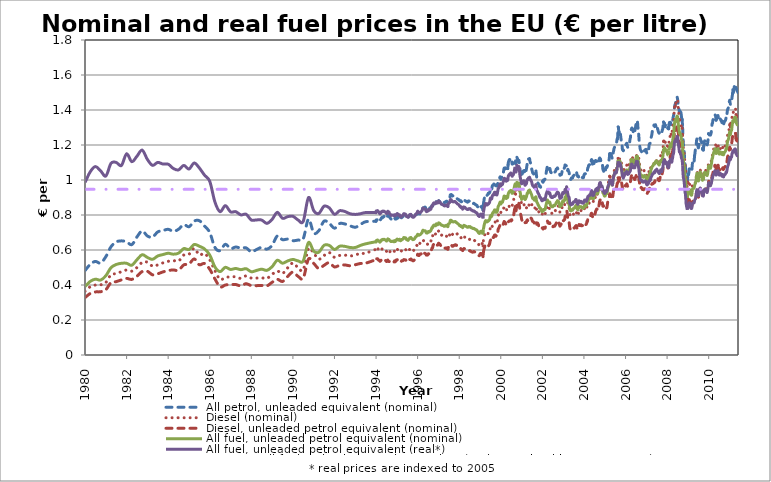
| Category | All petrol, unleaded equivalent (nominal) | Diesel (nominal) | Diesel, unleaded petrol equivalent (nominal) | All fuel, unleaded petrol equivalent (nominal) | All fuel, unleaded petrol equivalent (real*) | Average, all fuel, unleaded petrol equivalent (real*, weighted by consumption) |
|---|---|---|---|---|---|---|
| 1980-01-15 | 0.482 | 0.364 | 0.328 | 0.392 | 0.986 | 0.947 |
| 1980-04-15 | 0.518 | 0.39 | 0.351 | 0.42 | 1.047 | 0.947 |
| 1980-07-15 | 0.535 | 0.4 | 0.36 | 0.433 | 1.077 | 0.947 |
| 1980-10-15 | 0.525 | 0.401 | 0.362 | 0.428 | 1.052 | 0.947 |
| 1981-01-15 | 0.562 | 0.414 | 0.374 | 0.453 | 1.023 | 0.947 |
| 1981-04-15 | 0.618 | 0.459 | 0.413 | 0.499 | 1.095 | 0.947 |
| 1981-07-15 | 0.646 | 0.465 | 0.419 | 0.517 | 1.101 | 0.947 |
| 1981-10-15 | 0.652 | 0.476 | 0.429 | 0.524 | 1.083 | 0.947 |
| 1982-01-15 | 0.647 | 0.486 | 0.438 | 0.524 | 1.15 | 0.947 |
| 1982-04-15 | 0.631 | 0.479 | 0.432 | 0.513 | 1.105 | 0.947 |
| 1982-07-15 | 0.674 | 0.5 | 0.45 | 0.544 | 1.136 | 0.947 |
| 1982-10-15 | 0.709 | 0.529 | 0.477 | 0.573 | 1.171 | 0.947 |
| 1983-01-15 | 0.68 | 0.53 | 0.478 | 0.557 | 1.117 | 0.947 |
| 1983-04-15 | 0.674 | 0.508 | 0.458 | 0.547 | 1.084 | 0.947 |
| 1983-07-15 | 0.703 | 0.515 | 0.464 | 0.566 | 1.101 | 0.947 |
| 1983-10-15 | 0.711 | 0.527 | 0.475 | 0.574 | 1.091 | 0.947 |
| 1984-01-15 | 0.718 | 0.535 | 0.482 | 0.581 | 1.09 | 0.947 |
| 1984-04-15 | 0.707 | 0.539 | 0.486 | 0.576 | 1.066 | 0.947 |
| 1984-07-15 | 0.719 | 0.537 | 0.484 | 0.582 | 1.058 | 0.947 |
| 1984-10-15 | 0.745 | 0.571 | 0.515 | 0.608 | 1.083 | 0.947 |
| 1985-01-15 | 0.733 | 0.576 | 0.519 | 0.603 | 1.063 | 0.947 |
| 1985-04-15 | 0.765 | 0.609 | 0.549 | 0.631 | 1.097 | 0.947 |
| 1985-07-15 | 0.767 | 0.572 | 0.516 | 0.622 | 1.069 | 0.947 |
| 1985-10-15 | 0.737 | 0.58 | 0.523 | 0.606 | 1.028 | 0.947 |
| 1986-01-15 | 0.7 | 0.543 | 0.49 | 0.571 | 0.992 | 0.947 |
| 1986-04-15 | 0.615 | 0.482 | 0.435 | 0.503 | 0.874 | 0.947 |
| 1986-07-15 | 0.596 | 0.432 | 0.389 | 0.476 | 0.819 | 0.947 |
| 1986-10-15 | 0.633 | 0.444 | 0.4 | 0.501 | 0.853 | 0.947 |
| 1987-01-15 | 0.608 | 0.446 | 0.402 | 0.489 | 0.818 | 0.947 |
| 1987-04-15 | 0.617 | 0.447 | 0.403 | 0.494 | 0.819 | 0.947 |
| 1987-07-15 | 0.611 | 0.438 | 0.395 | 0.488 | 0.801 | 0.947 |
| 1987-10-15 | 0.612 | 0.452 | 0.407 | 0.493 | 0.804 | 0.947 |
| 1988-01-15 | 0.589 | 0.44 | 0.396 | 0.476 | 0.771 | 0.947 |
| 1988-04-15 | 0.603 | 0.44 | 0.396 | 0.483 | 0.772 | 0.947 |
| 1988-07-15 | 0.615 | 0.441 | 0.397 | 0.49 | 0.771 | 0.947 |
| 1988-10-15 | 0.605 | 0.438 | 0.395 | 0.484 | 0.752 | 0.947 |
| 1989-01-15 | 0.627 | 0.461 | 0.416 | 0.505 | 0.775 | 0.947 |
| 1989-04-15 | 0.68 | 0.48 | 0.432 | 0.542 | 0.815 | 0.947 |
| 1989-07-15 | 0.659 | 0.466 | 0.42 | 0.525 | 0.781 | 0.947 |
| 1989-10-15 | 0.662 | 0.498 | 0.449 | 0.538 | 0.79 | 0.947 |
| 1990-01-15 | 0.653 | 0.526 | 0.474 | 0.546 | 0.793 | 0.947 |
| 1990-04-15 | 0.657 | 0.499 | 0.45 | 0.538 | 0.772 | 0.947 |
| 1990-07-15 | 0.664 | 0.487 | 0.439 | 0.538 | 0.764 | 0.947 |
| 1990-10-15 | 0.776 | 0.608 | 0.548 | 0.643 | 0.9 | 0.947 |
| 1991-01-15 | 0.697 | 0.581 | 0.524 | 0.593 | 0.825 | 0.947 |
| 1991-04-15 | 0.711 | 0.548 | 0.494 | 0.588 | 0.809 | 0.947 |
| 1991-07-15 | 0.765 | 0.568 | 0.512 | 0.627 | 0.85 | 0.947 |
| 1991-10-15 | 0.753 | 0.585 | 0.528 | 0.626 | 0.841 | 0.947 |
| 1992-01-15 | 0.724 | 0.558 | 0.503 | 0.603 | 0.804 | 0.947 |
| 1992-04-15 | 0.751 | 0.569 | 0.513 | 0.622 | 0.825 | 0.947 |
| 1992-07-15 | 0.749 | 0.571 | 0.515 | 0.621 | 0.82 | 0.947 |
| 1992-10-15 | 0.738 | 0.566 | 0.51 | 0.614 | 0.807 | 0.947 |
| 1993-01-15 | 0.73 | 0.572 | 0.516 | 0.614 | 0.803 | 0.947 |
| 1993-04-15 | 0.745 | 0.58 | 0.523 | 0.626 | 0.807 | 0.947 |
| 1993-07-15 | 0.761 | 0.582 | 0.525 | 0.635 | 0.814 | 0.947 |
| 1994-01-03 | 0.764 | 0.603 | 0.543 | 0.647 | 0.814 | 0.947 |
| 1994-01-10 | 0.763 | 0.601 | 0.542 | 0.645 | 0.813 | 0.947 |
| 1994-01-17 | 0.772 | 0.61 | 0.55 | 0.653 | 0.823 | 0.947 |
| 1994-01-24 | 0.77 | 0.61 | 0.55 | 0.652 | 0.822 | 0.947 |
| 1994-01-31 | 0.771 | 0.61 | 0.55 | 0.653 | 0.822 | 0.947 |
| 1994-02-07 | 0.779 | 0.611 | 0.551 | 0.657 | 0.825 | 0.947 |
| 1994-02-14 | 0.778 | 0.609 | 0.549 | 0.656 | 0.824 | 0.947 |
| 1994-02-21 | 0.775 | 0.605 | 0.545 | 0.653 | 0.82 | 0.947 |
| 1994-02-28 | 0.774 | 0.601 | 0.542 | 0.651 | 0.817 | 0.947 |
| 1994-03-07 | 0.776 | 0.602 | 0.542 | 0.652 | 0.816 | 0.947 |
| 1994-03-14 | 0.771 | 0.598 | 0.54 | 0.649 | 0.811 | 0.947 |
| 1994-03-21 | 0.767 | 0.595 | 0.536 | 0.645 | 0.807 | 0.947 |
| 1994-03-28 | 0.77 | 0.595 | 0.536 | 0.647 | 0.809 | 0.947 |
| 1994-04-11 | 0.778 | 0.6 | 0.541 | 0.652 | 0.813 | 0.947 |
| 1994-04-18 | 0.783 | 0.604 | 0.545 | 0.657 | 0.819 | 0.947 |
| 1994-04-25 | 0.783 | 0.604 | 0.544 | 0.657 | 0.819 | 0.947 |
| 1994-05-02 | 0.787 | 0.607 | 0.547 | 0.66 | 0.822 | 0.947 |
| 1994-05-09 | 0.784 | 0.604 | 0.544 | 0.657 | 0.818 | 0.947 |
| 1994-05-16 | 0.788 | 0.607 | 0.547 | 0.661 | 0.822 | 0.947 |
| 1994-05-23 | 0.79 | 0.603 | 0.544 | 0.66 | 0.822 | 0.947 |
| 1994-05-30 | 0.789 | 0.602 | 0.542 | 0.66 | 0.821 | 0.947 |
| 1994-06-06 | 0.792 | 0.601 | 0.542 | 0.661 | 0.821 | 0.947 |
| 1994-06-13 | 0.791 | 0.6 | 0.541 | 0.66 | 0.82 | 0.947 |
| 1994-06-20 | 0.788 | 0.599 | 0.54 | 0.658 | 0.817 | 0.947 |
| 1994-06-27 | 0.787 | 0.599 | 0.54 | 0.657 | 0.816 | 0.947 |
| 1994-07-04 | 0.786 | 0.598 | 0.539 | 0.656 | 0.814 | 0.947 |
| 1994-07-11 | 0.784 | 0.595 | 0.537 | 0.654 | 0.812 | 0.947 |
| 1994-07-18 | 0.78 | 0.592 | 0.534 | 0.651 | 0.808 | 0.947 |
| 1994-07-25 | 0.785 | 0.595 | 0.537 | 0.655 | 0.813 | 0.947 |
| 1994-08-01 | 0.788 | 0.595 | 0.536 | 0.656 | 0.812 | 0.947 |
| 1994-08-08 | 0.797 | 0.602 | 0.543 | 0.664 | 0.821 | 0.947 |
| 1994-08-22 | 0.797 | 0.594 | 0.535 | 0.661 | 0.817 | 0.947 |
| 1994-08-29 | 0.796 | 0.593 | 0.535 | 0.66 | 0.817 | 0.947 |
| 1994-09-05 | 0.792 | 0.592 | 0.534 | 0.657 | 0.811 | 0.947 |
| 1994-09-12 | 0.786 | 0.59 | 0.532 | 0.654 | 0.807 | 0.947 |
| 1994-09-19 | 0.783 | 0.591 | 0.533 | 0.652 | 0.805 | 0.947 |
| 1994-09-26 | 0.78 | 0.591 | 0.533 | 0.651 | 0.803 | 0.947 |
| 1994-10-03 | 0.777 | 0.589 | 0.531 | 0.648 | 0.798 | 0.947 |
| 1994-10-10 | 0.777 | 0.59 | 0.532 | 0.649 | 0.798 | 0.947 |
| 1994-10-17 | 0.777 | 0.593 | 0.535 | 0.65 | 0.8 | 0.947 |
| 1994-10-24 | 0.775 | 0.593 | 0.535 | 0.648 | 0.798 | 0.947 |
| 1994-11-07 | 0.779 | 0.592 | 0.534 | 0.65 | 0.799 | 0.947 |
| 1994-11-14 | 0.778 | 0.592 | 0.533 | 0.65 | 0.798 | 0.947 |
| 1994-11-21 | 0.779 | 0.594 | 0.536 | 0.651 | 0.8 | 0.947 |
| 1994-11-28 | 0.773 | 0.59 | 0.532 | 0.647 | 0.795 | 0.947 |
| 1994-12-05 | 0.781 | 0.596 | 0.538 | 0.653 | 0.801 | 0.947 |
| 1994-12-12 | 0.78 | 0.595 | 0.536 | 0.652 | 0.8 | 0.947 |
| 1994-12-19 | 0.776 | 0.591 | 0.533 | 0.649 | 0.795 | 0.947 |
| 1995-01-02 | 0.78 | 0.602 | 0.542 | 0.658 | 0.803 | 0.947 |
| 1995-01-09 | 0.778 | 0.599 | 0.54 | 0.655 | 0.8 | 0.947 |
| 1995-01-16 | 0.786 | 0.603 | 0.544 | 0.661 | 0.807 | 0.947 |
| 1995-01-23 | 0.786 | 0.604 | 0.544 | 0.662 | 0.808 | 0.947 |
| 1995-01-30 | 0.783 | 0.6 | 0.541 | 0.658 | 0.804 | 0.947 |
| 1995-02-06 | 0.784 | 0.599 | 0.54 | 0.659 | 0.801 | 0.947 |
| 1995-02-13 | 0.785 | 0.601 | 0.542 | 0.66 | 0.802 | 0.947 |
| 1995-02-20 | 0.78 | 0.597 | 0.538 | 0.656 | 0.797 | 0.947 |
| 1995-02-27 | 0.786 | 0.598 | 0.539 | 0.659 | 0.801 | 0.947 |
| 1995-03-06 | 0.787 | 0.599 | 0.54 | 0.661 | 0.799 | 0.947 |
| 1995-03-13 | 0.78 | 0.594 | 0.536 | 0.655 | 0.792 | 0.947 |
| 1995-03-20 | 0.778 | 0.591 | 0.533 | 0.653 | 0.789 | 0.947 |
| 1995-03-27 | 0.78 | 0.593 | 0.535 | 0.655 | 0.792 | 0.947 |
| 1995-04-03 | 0.781 | 0.594 | 0.535 | 0.656 | 0.789 | 0.947 |
| 1995-04-10 | 0.787 | 0.598 | 0.539 | 0.66 | 0.795 | 0.947 |
| 1995-04-24 | 0.789 | 0.597 | 0.538 | 0.661 | 0.796 | 0.947 |
| 1995-05-02 | 0.792 | 0.599 | 0.54 | 0.663 | 0.798 | 0.947 |
| 1995-05-08 | 0.793 | 0.6 | 0.541 | 0.664 | 0.8 | 0.947 |
| 1995-05-15 | 0.802 | 0.605 | 0.545 | 0.671 | 0.808 | 0.947 |
| 1995-05-22 | 0.801 | 0.602 | 0.542 | 0.669 | 0.805 | 0.947 |
| 1995-05-29 | 0.802 | 0.604 | 0.545 | 0.671 | 0.807 | 0.947 |
| 1995-06-06 | 0.802 | 0.604 | 0.544 | 0.67 | 0.806 | 0.947 |
| 1995-06-12 | 0.801 | 0.603 | 0.543 | 0.669 | 0.804 | 0.947 |
| 1995-06-19 | 0.8 | 0.603 | 0.543 | 0.669 | 0.804 | 0.947 |
| 1995-06-26 | 0.797 | 0.598 | 0.539 | 0.665 | 0.799 | 0.947 |
| 1995-07-03 | 0.789 | 0.593 | 0.534 | 0.659 | 0.791 | 0.947 |
| 1995-07-10 | 0.788 | 0.593 | 0.534 | 0.658 | 0.79 | 0.947 |
| 1995-07-17 | 0.788 | 0.595 | 0.536 | 0.659 | 0.791 | 0.947 |
| 1995-07-24 | 0.786 | 0.594 | 0.536 | 0.658 | 0.79 | 0.947 |
| 1995-07-31 | 0.782 | 0.592 | 0.533 | 0.655 | 0.786 | 0.947 |
| 1995-08-07 | 0.788 | 0.595 | 0.537 | 0.659 | 0.79 | 0.947 |
| 1995-08-21 | 0.795 | 0.599 | 0.54 | 0.664 | 0.796 | 0.947 |
| 1995-08-28 | 0.799 | 0.605 | 0.545 | 0.669 | 0.802 | 0.947 |
| 1995-09-04 | 0.799 | 0.605 | 0.546 | 0.669 | 0.801 | 0.947 |
| 1995-09-11 | 0.796 | 0.604 | 0.545 | 0.667 | 0.799 | 0.947 |
| 1995-09-18 | 0.802 | 0.609 | 0.549 | 0.672 | 0.804 | 0.947 |
| 1995-09-25 | 0.795 | 0.606 | 0.546 | 0.667 | 0.798 | 0.947 |
| 1995-10-02 | 0.794 | 0.605 | 0.545 | 0.666 | 0.796 | 0.947 |
| 1995-10-09 | 0.789 | 0.601 | 0.542 | 0.662 | 0.791 | 0.947 |
| 1995-10-16 | 0.787 | 0.6 | 0.541 | 0.661 | 0.79 | 0.947 |
| 1995-10-23 | 0.785 | 0.598 | 0.539 | 0.659 | 0.787 | 0.947 |
| 1995-10-30 | 0.788 | 0.599 | 0.54 | 0.661 | 0.789 | 0.947 |
| 1995-11-06 | 0.787 | 0.598 | 0.539 | 0.66 | 0.787 | 0.947 |
| 1995-11-13 | 0.79 | 0.602 | 0.542 | 0.663 | 0.791 | 0.947 |
| 1995-11-20 | 0.791 | 0.601 | 0.542 | 0.663 | 0.792 | 0.947 |
| 1995-11-27 | 0.796 | 0.606 | 0.546 | 0.668 | 0.797 | 0.947 |
| 1995-12-04 | 0.801 | 0.61 | 0.55 | 0.672 | 0.801 | 0.947 |
| 1995-12-11 | 0.802 | 0.615 | 0.555 | 0.675 | 0.804 | 0.947 |
| 1995-12-18 | 0.801 | 0.618 | 0.557 | 0.675 | 0.805 | 0.947 |
| 1996-01-08 | 0.807 | 0.63 | 0.568 | 0.684 | 0.816 | 0.947 |
| 1996-01-15 | 0.811 | 0.639 | 0.576 | 0.69 | 0.822 | 0.947 |
| 1996-01-22 | 0.809 | 0.636 | 0.573 | 0.688 | 0.819 | 0.947 |
| 1996-01-29 | 0.807 | 0.632 | 0.57 | 0.685 | 0.816 | 0.947 |
| 1996-02-05 | 0.808 | 0.63 | 0.568 | 0.685 | 0.812 | 0.947 |
| 1996-02-12 | 0.807 | 0.632 | 0.57 | 0.685 | 0.813 | 0.947 |
| 1996-02-19 | 0.807 | 0.636 | 0.574 | 0.687 | 0.815 | 0.947 |
| 1996-02-26 | 0.806 | 0.639 | 0.576 | 0.687 | 0.816 | 0.947 |
| 1996-03-04 | 0.809 | 0.64 | 0.577 | 0.689 | 0.815 | 0.947 |
| 1996-03-11 | 0.813 | 0.64 | 0.577 | 0.691 | 0.816 | 0.947 |
| 1996-03-18 | 0.816 | 0.641 | 0.578 | 0.694 | 0.82 | 0.947 |
| 1996-03-25 | 0.819 | 0.644 | 0.581 | 0.696 | 0.822 | 0.947 |
| 1996-04-01 | 0.822 | 0.65 | 0.586 | 0.7 | 0.825 | 0.947 |
| 1996-04-15 | 0.839 | 0.658 | 0.593 | 0.712 | 0.84 | 0.947 |
| 1996-04-22 | 0.839 | 0.656 | 0.592 | 0.712 | 0.839 | 0.947 |
| 1996-04-29 | 0.839 | 0.652 | 0.588 | 0.71 | 0.837 | 0.947 |
| 1996-05-06 | 0.842 | 0.647 | 0.583 | 0.71 | 0.834 | 0.947 |
| 1996-05-13 | 0.844 | 0.645 | 0.581 | 0.709 | 0.834 | 0.947 |
| 1996-05-20 | 0.845 | 0.645 | 0.581 | 0.71 | 0.835 | 0.947 |
| 1996-05-28 | 0.845 | 0.643 | 0.58 | 0.709 | 0.834 | 0.947 |
| 1996-06-03 | 0.84 | 0.641 | 0.578 | 0.706 | 0.83 | 0.947 |
| 1996-06-10 | 0.833 | 0.637 | 0.575 | 0.701 | 0.824 | 0.947 |
| 1996-06-17 | 0.829 | 0.633 | 0.571 | 0.697 | 0.819 | 0.947 |
| 1996-06-24 | 0.833 | 0.634 | 0.572 | 0.699 | 0.822 | 0.947 |
| 1996-07-01 | 0.829 | 0.633 | 0.571 | 0.697 | 0.82 | 0.947 |
| 1996-07-08 | 0.831 | 0.634 | 0.571 | 0.698 | 0.822 | 0.947 |
| 1996-07-15 | 0.834 | 0.638 | 0.575 | 0.702 | 0.826 | 0.947 |
| 1996-07-22 | 0.839 | 0.642 | 0.579 | 0.706 | 0.831 | 0.947 |
| 1996-07-29 | 0.834 | 0.64 | 0.577 | 0.702 | 0.827 | 0.947 |
| 1996-08-05 | 0.835 | 0.64 | 0.577 | 0.703 | 0.827 | 0.947 |
| 1996-08-19 | 0.841 | 0.644 | 0.581 | 0.708 | 0.833 | 0.947 |
| 1996-08-26 | 0.84 | 0.643 | 0.58 | 0.707 | 0.832 | 0.947 |
| 1996-09-02 | 0.843 | 0.647 | 0.584 | 0.71 | 0.833 | 0.947 |
| 1996-09-09 | 0.846 | 0.658 | 0.593 | 0.716 | 0.839 | 0.947 |
| 1996-09-16 | 0.849 | 0.67 | 0.604 | 0.722 | 0.847 | 0.947 |
| 1996-09-23 | 0.854 | 0.678 | 0.611 | 0.728 | 0.854 | 0.947 |
| 1996-09-30 | 0.85 | 0.677 | 0.61 | 0.725 | 0.851 | 0.947 |
| 1996-10-07 | 0.854 | 0.685 | 0.618 | 0.731 | 0.856 | 0.947 |
| 1996-10-14 | 0.858 | 0.697 | 0.628 | 0.738 | 0.865 | 0.947 |
| 1996-10-21 | 0.86 | 0.7 | 0.631 | 0.741 | 0.868 | 0.947 |
| 1996-10-28 | 0.863 | 0.7 | 0.631 | 0.742 | 0.869 | 0.947 |
| 1996-11-04 | 0.864 | 0.697 | 0.628 | 0.741 | 0.868 | 0.947 |
| 1996-11-11 | 0.863 | 0.692 | 0.624 | 0.739 | 0.865 | 0.947 |
| 1996-11-18 | 0.865 | 0.692 | 0.624 | 0.74 | 0.866 | 0.947 |
| 1996-11-25 | 0.864 | 0.691 | 0.623 | 0.739 | 0.865 | 0.947 |
| 1996-12-02 | 0.875 | 0.698 | 0.63 | 0.747 | 0.872 | 0.947 |
| 1996-12-09 | 0.876 | 0.702 | 0.633 | 0.749 | 0.875 | 0.947 |
| 1996-12-16 | 0.871 | 0.697 | 0.628 | 0.745 | 0.87 | 0.947 |
| 1997-01-06 | 0.872 | 0.698 | 0.629 | 0.746 | 0.869 | 0.947 |
| 1997-01-13 | 0.878 | 0.706 | 0.637 | 0.752 | 0.877 | 0.947 |
| 1997-01-20 | 0.883 | 0.708 | 0.639 | 0.755 | 0.881 | 0.947 |
| 1997-01-27 | 0.878 | 0.703 | 0.633 | 0.75 | 0.875 | 0.947 |
| 1997-02-03 | 0.876 | 0.7 | 0.631 | 0.749 | 0.871 | 0.947 |
| 1997-02-10 | 0.88 | 0.702 | 0.633 | 0.751 | 0.874 | 0.947 |
| 1997-02-17 | 0.879 | 0.697 | 0.628 | 0.748 | 0.871 | 0.947 |
| 1997-02-24 | 0.875 | 0.693 | 0.625 | 0.745 | 0.867 | 0.947 |
| 1997-03-03 | 0.874 | 0.691 | 0.623 | 0.744 | 0.864 | 0.947 |
| 1997-03-10 | 0.874 | 0.685 | 0.618 | 0.741 | 0.861 | 0.947 |
| 1997-03-17 | 0.876 | 0.684 | 0.617 | 0.742 | 0.862 | 0.947 |
| 1997-03-24 | 0.875 | 0.683 | 0.616 | 0.741 | 0.86 | 0.947 |
| 1997-04-07 | 0.874 | 0.68 | 0.613 | 0.739 | 0.858 | 0.947 |
| 1997-04-14 | 0.874 | 0.679 | 0.612 | 0.739 | 0.857 | 0.947 |
| 1997-04-21 | 0.87 | 0.676 | 0.609 | 0.735 | 0.853 | 0.947 |
| 1997-04-28 | 0.872 | 0.676 | 0.61 | 0.737 | 0.855 | 0.947 |
| 1997-05-05 | 0.871 | 0.676 | 0.609 | 0.736 | 0.851 | 0.947 |
| 1997-05-12 | 0.875 | 0.678 | 0.611 | 0.739 | 0.855 | 0.947 |
| 1997-05-19 | 0.873 | 0.676 | 0.609 | 0.737 | 0.853 | 0.947 |
| 1997-05-26 | 0.876 | 0.678 | 0.612 | 0.74 | 0.856 | 0.947 |
| 1997-06-02 | 0.879 | 0.679 | 0.612 | 0.741 | 0.857 | 0.947 |
| 1997-06-09 | 0.879 | 0.678 | 0.611 | 0.741 | 0.857 | 0.947 |
| 1997-06-16 | 0.874 | 0.672 | 0.606 | 0.736 | 0.851 | 0.947 |
| 1997-06-23 | 0.875 | 0.673 | 0.607 | 0.737 | 0.852 | 0.947 |
| 1997-06-30 | 0.872 | 0.669 | 0.604 | 0.733 | 0.848 | 0.947 |
| 1997-07-07 | 0.889 | 0.681 | 0.614 | 0.747 | 0.864 | 0.947 |
| 1997-07-14 | 0.892 | 0.683 | 0.616 | 0.75 | 0.867 | 0.947 |
| 1997-07-28 | 0.896 | 0.685 | 0.618 | 0.753 | 0.871 | 0.947 |
| 1997-08-04 | 0.901 | 0.69 | 0.622 | 0.758 | 0.874 | 0.947 |
| 1997-08-11 | 0.915 | 0.701 | 0.632 | 0.769 | 0.887 | 0.947 |
| 1997-08-18 | 0.913 | 0.699 | 0.63 | 0.768 | 0.886 | 0.947 |
| 1997-08-25 | 0.917 | 0.699 | 0.631 | 0.77 | 0.888 | 0.947 |
| 1997-09-01 | 0.916 | 0.697 | 0.629 | 0.768 | 0.884 | 0.947 |
| 1997-09-08 | 0.911 | 0.693 | 0.625 | 0.764 | 0.879 | 0.947 |
| 1997-09-15 | 0.909 | 0.689 | 0.621 | 0.761 | 0.876 | 0.947 |
| 1997-09-22 | 0.911 | 0.69 | 0.622 | 0.763 | 0.878 | 0.947 |
| 1997-09-29 | 0.906 | 0.69 | 0.622 | 0.76 | 0.875 | 0.947 |
| 1997-10-06 | 0.905 | 0.692 | 0.624 | 0.761 | 0.875 | 0.947 |
| 1997-10-13 | 0.904 | 0.695 | 0.626 | 0.761 | 0.876 | 0.947 |
| 1997-10-20 | 0.905 | 0.695 | 0.627 | 0.762 | 0.877 | 0.947 |
| 1997-10-27 | 0.904 | 0.696 | 0.627 | 0.762 | 0.876 | 0.947 |
| 1997-11-03 | 0.905 | 0.698 | 0.629 | 0.763 | 0.877 | 0.947 |
| 1997-11-10 | 0.901 | 0.699 | 0.63 | 0.761 | 0.875 | 0.947 |
| 1997-11-17 | 0.899 | 0.696 | 0.627 | 0.758 | 0.871 | 0.947 |
| 1997-11-24 | 0.896 | 0.694 | 0.626 | 0.757 | 0.87 | 0.947 |
| 1997-12-01 | 0.895 | 0.695 | 0.627 | 0.757 | 0.868 | 0.947 |
| 1997-12-08 | 0.894 | 0.692 | 0.624 | 0.754 | 0.866 | 0.947 |
| 1997-12-15 | 0.891 | 0.69 | 0.622 | 0.752 | 0.863 | 0.947 |
| 1998-01-05 | 0.888 | 0.684 | 0.617 | 0.746 | 0.859 | 0.947 |
| 1998-01-12 | 0.886 | 0.682 | 0.615 | 0.745 | 0.857 | 0.947 |
| 1998-01-19 | 0.882 | 0.676 | 0.609 | 0.74 | 0.852 | 0.947 |
| 1998-01-26 | 0.881 | 0.674 | 0.608 | 0.738 | 0.85 | 0.947 |
| 1998-02-02 | 0.88 | 0.673 | 0.607 | 0.738 | 0.847 | 0.947 |
| 1998-02-09 | 0.882 | 0.675 | 0.609 | 0.739 | 0.849 | 0.947 |
| 1998-02-16 | 0.876 | 0.67 | 0.604 | 0.734 | 0.843 | 0.947 |
| 1998-02-23 | 0.876 | 0.669 | 0.603 | 0.734 | 0.842 | 0.947 |
| 1998-03-02 | 0.875 | 0.667 | 0.601 | 0.732 | 0.839 | 0.947 |
| 1998-03-09 | 0.876 | 0.666 | 0.6 | 0.732 | 0.839 | 0.947 |
| 1998-03-16 | 0.87 | 0.661 | 0.596 | 0.727 | 0.833 | 0.947 |
| 1998-03-23 | 0.876 | 0.666 | 0.6 | 0.732 | 0.838 | 0.947 |
| 1998-03-30 | 0.883 | 0.672 | 0.606 | 0.739 | 0.846 | 0.947 |
| 1998-04-06 | 0.885 | 0.675 | 0.608 | 0.741 | 0.846 | 0.947 |
| 1998-04-20 | 0.883 | 0.673 | 0.607 | 0.739 | 0.844 | 0.947 |
| 1998-04-27 | 0.882 | 0.672 | 0.606 | 0.738 | 0.843 | 0.947 |
| 1998-05-04 | 0.881 | 0.671 | 0.605 | 0.737 | 0.839 | 0.947 |
| 1998-05-11 | 0.878 | 0.67 | 0.604 | 0.735 | 0.837 | 0.947 |
| 1998-05-18 | 0.878 | 0.668 | 0.603 | 0.735 | 0.836 | 0.947 |
| 1998-05-25 | 0.877 | 0.665 | 0.599 | 0.732 | 0.834 | 0.947 |
| 1998-06-01 | 0.876 | 0.664 | 0.599 | 0.732 | 0.833 | 0.947 |
| 1998-06-08 | 0.873 | 0.662 | 0.597 | 0.729 | 0.831 | 0.947 |
| 1998-06-15 | 0.875 | 0.662 | 0.596 | 0.73 | 0.831 | 0.947 |
| 1998-06-22 | 0.878 | 0.661 | 0.596 | 0.731 | 0.833 | 0.947 |
| 1998-06-29 | 0.881 | 0.663 | 0.598 | 0.734 | 0.836 | 0.947 |
| 1998-07-06 | 0.878 | 0.662 | 0.597 | 0.732 | 0.834 | 0.947 |
| 1998-07-13 | 0.881 | 0.661 | 0.596 | 0.733 | 0.836 | 0.947 |
| 1998-07-20 | 0.882 | 0.662 | 0.596 | 0.734 | 0.837 | 0.947 |
| 1998-07-27 | 0.883 | 0.66 | 0.595 | 0.733 | 0.836 | 0.947 |
| 1998-08-03 | 0.878 | 0.657 | 0.592 | 0.73 | 0.831 | 0.947 |
| 1998-08-10 | 0.875 | 0.656 | 0.592 | 0.728 | 0.829 | 0.947 |
| 1998-08-17 | 0.874 | 0.654 | 0.59 | 0.727 | 0.828 | 0.947 |
| 1998-08-24 | 0.875 | 0.654 | 0.589 | 0.727 | 0.828 | 0.947 |
| 1998-08-31 | 0.875 | 0.653 | 0.589 | 0.726 | 0.827 | 0.947 |
| 1998-09-07 | 0.871 | 0.652 | 0.587 | 0.724 | 0.823 | 0.947 |
| 1998-09-14 | 0.868 | 0.652 | 0.588 | 0.723 | 0.822 | 0.947 |
| 1998-09-21 | 0.866 | 0.654 | 0.59 | 0.722 | 0.822 | 0.947 |
| 1998-09-28 | 0.867 | 0.656 | 0.591 | 0.724 | 0.824 | 0.947 |
| 1998-10-05 | 0.864 | 0.654 | 0.59 | 0.722 | 0.821 | 0.947 |
| 1998-10-12 | 0.864 | 0.654 | 0.589 | 0.721 | 0.821 | 0.947 |
| 1998-10-19 | 0.861 | 0.651 | 0.587 | 0.719 | 0.818 | 0.947 |
| 1998-10-26 | 0.86 | 0.65 | 0.586 | 0.718 | 0.817 | 0.947 |
| 1998-11-02 | 0.858 | 0.647 | 0.584 | 0.715 | 0.814 | 0.947 |
| 1998-11-09 | 0.858 | 0.648 | 0.584 | 0.715 | 0.814 | 0.947 |
| 1998-11-16 | 0.856 | 0.646 | 0.583 | 0.714 | 0.812 | 0.947 |
| 1998-11-23 | 0.854 | 0.646 | 0.582 | 0.713 | 0.811 | 0.947 |
| 1998-11-30 | 0.848 | 0.641 | 0.578 | 0.707 | 0.805 | 0.947 |
| 1998-12-07 | 0.846 | 0.638 | 0.575 | 0.705 | 0.802 | 0.947 |
| 1998-12-14 | 0.841 | 0.634 | 0.571 | 0.701 | 0.796 | 0.947 |
| 1999-01-04 | 0.833 | 0.629 | 0.567 | 0.694 | 0.791 | 0.947 |
| 1999-01-11 | 0.839 | 0.636 | 0.574 | 0.7 | 0.798 | 0.947 |
| 1999-01-18 | 0.843 | 0.642 | 0.579 | 0.705 | 0.803 | 0.947 |
| 1999-01-25 | 0.846 | 0.643 | 0.58 | 0.706 | 0.805 | 0.947 |
| 1999-02-01 | 0.847 | 0.644 | 0.58 | 0.707 | 0.804 | 0.947 |
| 1999-02-08 | 0.848 | 0.642 | 0.578 | 0.707 | 0.804 | 0.947 |
| 1999-02-15 | 0.842 | 0.636 | 0.573 | 0.701 | 0.797 | 0.947 |
| 1999-02-22 | 0.845 | 0.637 | 0.574 | 0.703 | 0.799 | 0.947 |
| 1999-03-01 | 0.844 | 0.636 | 0.574 | 0.702 | 0.795 | 0.947 |
| 1999-03-08 | 0.829 | 0.623 | 0.562 | 0.689 | 0.78 | 0.947 |
| 1999-03-15 | 0.863 | 0.653 | 0.589 | 0.719 | 0.814 | 0.947 |
| 1999-03-22 | 0.876 | 0.663 | 0.598 | 0.73 | 0.827 | 0.947 |
| 1999-03-29 | 0.891 | 0.675 | 0.609 | 0.743 | 0.841 | 0.947 |
| 1999-04-12 | 0.909 | 0.692 | 0.624 | 0.76 | 0.857 | 0.947 |
| 1999-04-19 | 0.916 | 0.698 | 0.629 | 0.766 | 0.863 | 0.947 |
| 1999-04-26 | 0.919 | 0.699 | 0.631 | 0.768 | 0.866 | 0.947 |
| 1999-05-03 | 0.918 | 0.698 | 0.63 | 0.767 | 0.864 | 0.947 |
| 1999-05-10 | 0.915 | 0.694 | 0.626 | 0.764 | 0.86 | 0.947 |
| 1999-05-17 | 0.912 | 0.69 | 0.622 | 0.76 | 0.857 | 0.947 |
| 1999-05-24 | 0.915 | 0.691 | 0.623 | 0.762 | 0.858 | 0.947 |
| 1999-05-31 | 0.917 | 0.691 | 0.623 | 0.763 | 0.859 | 0.947 |
| 1999-06-07 | 0.923 | 0.695 | 0.627 | 0.768 | 0.865 | 0.947 |
| 1999-06-14 | 0.922 | 0.693 | 0.625 | 0.767 | 0.863 | 0.947 |
| 1999-06-21 | 0.925 | 0.696 | 0.628 | 0.769 | 0.867 | 0.947 |
| 1999-06-28 | 0.926 | 0.7 | 0.631 | 0.772 | 0.869 | 0.947 |
| 1999-07-05 | 0.93 | 0.711 | 0.641 | 0.778 | 0.877 | 0.947 |
| 1999-07-12 | 0.943 | 0.722 | 0.651 | 0.79 | 0.891 | 0.947 |
| 1999-07-19 | 0.949 | 0.729 | 0.657 | 0.796 | 0.897 | 0.947 |
| 1999-07-26 | 0.941 | 0.722 | 0.651 | 0.789 | 0.889 | 0.947 |
| 1999-08-02 | 0.948 | 0.727 | 0.656 | 0.795 | 0.895 | 0.947 |
| 1999-08-09 | 0.947 | 0.725 | 0.654 | 0.793 | 0.893 | 0.947 |
| 1999-08-16 | 0.963 | 0.734 | 0.662 | 0.805 | 0.906 | 0.947 |
| 1999-08-23 | 0.968 | 0.738 | 0.665 | 0.81 | 0.911 | 0.947 |
| 1999-08-30 | 0.972 | 0.744 | 0.671 | 0.814 | 0.916 | 0.947 |
| 1999-09-06 | 0.97 | 0.744 | 0.671 | 0.813 | 0.913 | 0.947 |
| 1999-09-13 | 0.974 | 0.746 | 0.673 | 0.816 | 0.916 | 0.947 |
| 1999-09-20 | 0.983 | 0.754 | 0.68 | 0.825 | 0.925 | 0.947 |
| 1999-09-27 | 0.988 | 0.76 | 0.685 | 0.829 | 0.93 | 0.947 |
| 1999-10-04 | 0.983 | 0.758 | 0.683 | 0.826 | 0.927 | 0.947 |
| 1999-10-11 | 0.986 | 0.76 | 0.686 | 0.829 | 0.93 | 0.947 |
| 1999-10-18 | 0.967 | 0.753 | 0.679 | 0.816 | 0.916 | 0.947 |
| 1999-10-25 | 0.972 | 0.755 | 0.681 | 0.819 | 0.92 | 0.947 |
| 1999-11-02 | 0.971 | 0.758 | 0.683 | 0.82 | 0.92 | 0.947 |
| 1999-11-08 | 0.965 | 0.754 | 0.68 | 0.816 | 0.915 | 0.947 |
| 1999-11-15 | 0.971 | 0.764 | 0.689 | 0.823 | 0.923 | 0.947 |
| 1999-11-22 | 0.981 | 0.777 | 0.7 | 0.833 | 0.935 | 0.947 |
| 1999-11-29 | 0.993 | 0.796 | 0.717 | 0.848 | 0.951 | 0.947 |
| 1999-12-06 | 0.996 | 0.801 | 0.722 | 0.852 | 0.952 | 0.947 |
| 1999-12-13 | 1.001 | 0.806 | 0.727 | 0.857 | 0.957 | 0.947 |
| 2000-01-03 | 1.018 | 0.823 | 0.742 | 0.874 | 0.978 | 0.947 |
| 2000-01-10 | 1.01 | 0.821 | 0.74 | 0.869 | 0.972 | 0.947 |
| 2000-01-17 | 1.004 | 0.815 | 0.734 | 0.863 | 0.966 | 0.947 |
| 2000-01-24 | 1.013 | 0.821 | 0.74 | 0.87 | 0.974 | 0.947 |
| 2000-01-31 | 1.015 | 0.825 | 0.744 | 0.873 | 0.978 | 0.947 |
| 2000-02-07 | 1.016 | 0.824 | 0.743 | 0.873 | 0.974 | 0.947 |
| 2000-02-14 | 1.017 | 0.825 | 0.744 | 0.874 | 0.975 | 0.947 |
| 2000-02-21 | 1.032 | 0.829 | 0.748 | 0.883 | 0.986 | 0.947 |
| 2000-02-28 | 1.041 | 0.83 | 0.748 | 0.888 | 0.99 | 0.947 |
| 2000-03-06 | 1.055 | 0.838 | 0.756 | 0.899 | 0.999 | 0.947 |
| 2000-03-13 | 1.067 | 0.846 | 0.763 | 0.908 | 1.01 | 0.947 |
| 2000-03-20 | 1.067 | 0.843 | 0.76 | 0.906 | 1.008 | 0.947 |
| 2000-03-27 | 1.069 | 0.841 | 0.759 | 0.907 | 1.008 | 0.947 |
| 2000-04-03 | 1.069 | 0.839 | 0.756 | 0.906 | 1.006 | 0.947 |
| 2000-04-10 | 1.06 | 0.832 | 0.75 | 0.898 | 0.997 | 0.947 |
| 2000-04-17 | 1.057 | 0.828 | 0.746 | 0.895 | 0.993 | 0.947 |
| 2000-04-24 | 1.057 | 0.829 | 0.747 | 0.895 | 0.994 | 0.947 |
| 2000-05-01 | 1.072 | 0.836 | 0.753 | 0.906 | 1.004 | 0.947 |
| 2000-05-08 | 1.07 | 0.837 | 0.755 | 0.906 | 1.003 | 0.947 |
| 2000-05-15 | 1.065 | 0.832 | 0.75 | 0.9 | 0.998 | 0.947 |
| 2000-05-22 | 1.088 | 0.842 | 0.759 | 0.916 | 1.015 | 0.947 |
| 2000-05-29 | 1.104 | 0.845 | 0.762 | 0.926 | 1.026 | 0.947 |
| 2000-06-05 | 1.109 | 0.846 | 0.763 | 0.928 | 1.026 | 0.947 |
| 2000-06-12 | 1.116 | 0.85 | 0.766 | 0.934 | 1.032 | 0.947 |
| 2000-06-19 | 1.115 | 0.849 | 0.765 | 0.933 | 1.031 | 0.947 |
| 2000-06-26 | 1.124 | 0.85 | 0.767 | 0.938 | 1.036 | 0.947 |
| 2000-07-03 | 1.125 | 0.851 | 0.767 | 0.939 | 1.038 | 0.947 |
| 2000-07-10 | 1.124 | 0.856 | 0.772 | 0.94 | 1.04 | 0.947 |
| 2000-07-17 | 1.115 | 0.85 | 0.766 | 0.933 | 1.032 | 0.947 |
| 2000-07-24 | 1.11 | 0.857 | 0.773 | 0.934 | 1.033 | 0.947 |
| 2000-07-31 | 1.092 | 0.854 | 0.77 | 0.924 | 1.022 | 0.947 |
| 2000-08-07 | 1.093 | 0.859 | 0.774 | 0.926 | 1.024 | 0.947 |
| 2000-08-14 | 1.1 | 0.866 | 0.781 | 0.933 | 1.031 | 0.947 |
| 2000-08-21 | 1.094 | 0.869 | 0.783 | 0.931 | 1.03 | 0.947 |
| 2000-08-28 | 1.095 | 0.885 | 0.798 | 0.939 | 1.038 | 0.947 |
| 2000-09-04 | 1.099 | 0.904 | 0.815 | 0.95 | 1.044 | 0.947 |
| 2000-09-11 | 1.112 | 0.918 | 0.828 | 0.963 | 1.058 | 0.947 |
| 2000-09-18 | 1.117 | 0.934 | 0.842 | 0.972 | 1.069 | 0.947 |
| 2000-09-25 | 1.12 | 0.941 | 0.849 | 0.977 | 1.074 | 0.947 |
| 2000-10-02 | 1.101 | 0.919 | 0.828 | 0.958 | 1.052 | 0.947 |
| 2000-10-09 | 1.093 | 0.915 | 0.825 | 0.952 | 1.046 | 0.947 |
| 2000-10-16 | 1.106 | 0.934 | 0.842 | 0.967 | 1.063 | 0.947 |
| 2000-10-23 | 1.13 | 0.95 | 0.857 | 0.986 | 1.083 | 0.947 |
| 2000-11-06 | 1.119 | 0.944 | 0.851 | 0.978 | 1.072 | 0.947 |
| 2000-11-13 | 1.107 | 0.937 | 0.844 | 0.968 | 1.062 | 0.947 |
| 2000-11-20 | 1.108 | 0.948 | 0.855 | 0.974 | 1.069 | 0.947 |
| 2000-11-27 | 1.113 | 0.961 | 0.867 | 0.983 | 1.077 | 0.947 |
| 2000-12-04 | 1.099 | 0.95 | 0.857 | 0.971 | 1.062 | 0.947 |
| 2000-12-11 | 1.081 | 0.934 | 0.842 | 0.955 | 1.044 | 0.947 |
| 2000-12-18 | 1.06 | 0.911 | 0.821 | 0.934 | 1.021 | 0.947 |
| 2001-01-08 | 1.021 | 0.876 | 0.79 | 0.9 | 0.99 | 0.947 |
| 2001-01-15 | 1.016 | 0.859 | 0.775 | 0.889 | 0.979 | 0.947 |
| 2001-01-22 | 1.029 | 0.854 | 0.77 | 0.893 | 0.983 | 0.947 |
| 2001-01-29 | 1.04 | 0.857 | 0.772 | 0.9 | 0.99 | 0.947 |
| 2001-02-05 | 1.041 | 0.854 | 0.77 | 0.899 | 0.986 | 0.947 |
| 2001-02-12 | 1.05 | 0.856 | 0.772 | 0.904 | 0.992 | 0.947 |
| 2001-02-20 | 1.053 | 0.859 | 0.775 | 0.907 | 0.995 | 0.947 |
| 2001-02-27 | 1.052 | 0.858 | 0.774 | 0.906 | 0.994 | 0.947 |
| 2001-03-05 | 1.053 | 0.853 | 0.769 | 0.904 | 0.987 | 0.947 |
| 2001-03-12 | 1.035 | 0.842 | 0.759 | 0.89 | 0.972 | 0.947 |
| 2001-03-19 | 1.036 | 0.839 | 0.756 | 0.889 | 0.97 | 0.947 |
| 2001-03-26 | 1.041 | 0.841 | 0.758 | 0.892 | 0.974 | 0.947 |
| 2001-04-02 | 1.052 | 0.844 | 0.761 | 0.9 | 0.976 | 0.947 |
| 2001-04-09 | 1.063 | 0.84 | 0.758 | 0.903 | 0.979 | 0.947 |
| 2001-04-23 | 1.092 | 0.856 | 0.772 | 0.924 | 1.002 | 0.947 |
| 2001-04-30 | 1.093 | 0.852 | 0.768 | 0.923 | 1.001 | 0.947 |
| 2001-05-07 | 1.106 | 0.856 | 0.772 | 0.931 | 1.004 | 0.947 |
| 2001-05-14 | 1.119 | 0.859 | 0.774 | 0.938 | 1.012 | 0.947 |
| 2001-05-21 | 1.118 | 0.855 | 0.771 | 0.936 | 1.01 | 0.947 |
| 2001-05-28 | 1.12 | 0.859 | 0.775 | 0.939 | 1.013 | 0.947 |
| 2001-06-04 | 1.122 | 0.866 | 0.781 | 0.943 | 1.015 | 0.947 |
| 2001-06-11 | 1.105 | 0.862 | 0.777 | 0.933 | 1.005 | 0.947 |
| 2001-06-18 | 1.101 | 0.865 | 0.78 | 0.932 | 1.004 | 0.947 |
| 2001-06-25 | 1.083 | 0.868 | 0.783 | 0.926 | 0.997 | 0.947 |
| 2001-07-02 | 1.076 | 0.866 | 0.781 | 0.921 | 0.996 | 0.947 |
| 2001-07-09 | 1.066 | 0.864 | 0.779 | 0.916 | 0.99 | 0.947 |
| 2001-07-16 | 1.056 | 0.856 | 0.772 | 0.907 | 0.98 | 0.947 |
| 2001-07-23 | 1.048 | 0.849 | 0.765 | 0.899 | 0.972 | 0.947 |
| 2001-07-30 | 1.04 | 0.846 | 0.763 | 0.894 | 0.967 | 0.947 |
| 2001-08-06 | 1.039 | 0.845 | 0.762 | 0.894 | 0.966 | 0.947 |
| 2001-08-13 | 1.034 | 0.843 | 0.76 | 0.89 | 0.962 | 0.947 |
| 2001-08-20 | 1.035 | 0.84 | 0.758 | 0.889 | 0.961 | 0.947 |
| 2001-08-27 | 1.03 | 0.835 | 0.753 | 0.885 | 0.956 | 0.947 |
| 2001-09-03 | 1.04 | 0.839 | 0.756 | 0.891 | 0.96 | 0.947 |
| 2001-09-10 | 1.052 | 0.844 | 0.761 | 0.899 | 0.969 | 0.947 |
| 2001-09-17 | 1.05 | 0.846 | 0.763 | 0.899 | 0.969 | 0.947 |
| 2001-09-24 | 1.052 | 0.853 | 0.769 | 0.903 | 0.973 | 0.947 |
| 2001-10-01 | 1.03 | 0.836 | 0.754 | 0.885 | 0.954 | 0.947 |
| 2001-10-08 | 1.014 | 0.828 | 0.747 | 0.874 | 0.941 | 0.947 |
| 2001-10-15 | 1.003 | 0.834 | 0.752 | 0.871 | 0.938 | 0.947 |
| 2001-10-22 | 0.991 | 0.836 | 0.754 | 0.866 | 0.933 | 0.947 |
| 2001-10-29 | 0.981 | 0.831 | 0.749 | 0.859 | 0.926 | 0.947 |
| 2001-11-05 | 0.98 | 0.827 | 0.746 | 0.857 | 0.924 | 0.947 |
| 2001-11-12 | 0.975 | 0.819 | 0.738 | 0.85 | 0.917 | 0.947 |
| 2001-11-19 | 0.973 | 0.817 | 0.737 | 0.849 | 0.915 | 0.947 |
| 2001-11-26 | 0.962 | 0.809 | 0.729 | 0.84 | 0.906 | 0.947 |
| 2001-12-03 | 0.963 | 0.805 | 0.725 | 0.838 | 0.9 | 0.947 |
| 2001-12-10 | 0.964 | 0.805 | 0.726 | 0.839 | 0.901 | 0.947 |
| 2001-12-17 | 0.959 | 0.801 | 0.722 | 0.835 | 0.897 | 0.947 |
| 2002-01-07 | 0.977 | 0.801 | 0.722 | 0.819 | 0.881 | 0.947 |
| 2002-01-14 | 0.993 | 0.806 | 0.727 | 0.828 | 0.89 | 0.947 |
| 2002-01-21 | 0.989 | 0.801 | 0.723 | 0.824 | 0.886 | 0.947 |
| 2002-01-28 | 0.988 | 0.799 | 0.72 | 0.822 | 0.884 | 0.947 |
| 2002-02-04 | 1 | 0.807 | 0.728 | 0.831 | 0.893 | 0.947 |
| 2002-02-11 | 0.998 | 0.805 | 0.726 | 0.829 | 0.89 | 0.947 |
| 2002-02-18 | 0.999 | 0.803 | 0.724 | 0.829 | 0.89 | 0.947 |
| 2002-02-25 | 1.004 | 0.805 | 0.726 | 0.832 | 0.893 | 0.947 |
| 2002-03-04 | 1.006 | 0.804 | 0.725 | 0.832 | 0.888 | 0.947 |
| 2002-03-11 | 1.019 | 0.816 | 0.736 | 0.843 | 0.901 | 0.947 |
| 2002-03-18 | 1.033 | 0.827 | 0.746 | 0.855 | 0.913 | 0.947 |
| 2002-03-25 | 1.046 | 0.834 | 0.752 | 0.864 | 0.923 | 0.947 |
| 2002-04-08 | 1.073 | 0.845 | 0.762 | 0.88 | 0.935 | 0.947 |
| 2002-04-15 | 1.081 | 0.848 | 0.765 | 0.885 | 0.94 | 0.947 |
| 2002-04-22 | 1.071 | 0.837 | 0.755 | 0.875 | 0.93 | 0.947 |
| 2002-04-29 | 1.073 | 0.84 | 0.757 | 0.877 | 0.932 | 0.947 |
| 2002-05-06 | 1.069 | 0.838 | 0.756 | 0.875 | 0.928 | 0.947 |
| 2002-05-13 | 1.06 | 0.833 | 0.751 | 0.869 | 0.921 | 0.947 |
| 2002-05-20 | 1.066 | 0.839 | 0.756 | 0.874 | 0.927 | 0.947 |
| 2002-05-27 | 1.065 | 0.835 | 0.752 | 0.871 | 0.924 | 0.947 |
| 2002-06-03 | 1.053 | 0.824 | 0.743 | 0.861 | 0.913 | 0.947 |
| 2002-06-10 | 1.044 | 0.816 | 0.736 | 0.853 | 0.905 | 0.947 |
| 2002-06-17 | 1.043 | 0.814 | 0.734 | 0.852 | 0.903 | 0.947 |
| 2002-06-24 | 1.038 | 0.812 | 0.732 | 0.849 | 0.9 | 0.947 |
| 2002-07-01 | 1.038 | 0.809 | 0.73 | 0.847 | 0.9 | 0.947 |
| 2002-07-08 | 1.04 | 0.811 | 0.731 | 0.849 | 0.902 | 0.947 |
| 2002-07-15 | 1.039 | 0.809 | 0.729 | 0.847 | 0.9 | 0.947 |
| 2002-07-22 | 1.042 | 0.816 | 0.736 | 0.852 | 0.906 | 0.947 |
| 2002-07-29 | 1.046 | 0.816 | 0.735 | 0.854 | 0.907 | 0.947 |
| 2002-08-05 | 1.051 | 0.817 | 0.737 | 0.856 | 0.909 | 0.947 |
| 2002-08-12 | 1.047 | 0.815 | 0.735 | 0.854 | 0.906 | 0.947 |
| 2002-08-19 | 1.046 | 0.817 | 0.736 | 0.854 | 0.906 | 0.947 |
| 2002-08-26 | 1.047 | 0.823 | 0.742 | 0.858 | 0.91 | 0.947 |
| 2002-09-02 | 1.05 | 0.826 | 0.745 | 0.861 | 0.911 | 0.947 |
| 2002-09-09 | 1.057 | 0.831 | 0.749 | 0.866 | 0.916 | 0.947 |
| 2002-09-16 | 1.063 | 0.836 | 0.754 | 0.871 | 0.922 | 0.947 |
| 2002-09-23 | 1.063 | 0.84 | 0.757 | 0.874 | 0.924 | 0.947 |
| 2002-09-30 | 1.066 | 0.845 | 0.762 | 0.878 | 0.929 | 0.947 |
| 2002-10-07 | 1.069 | 0.852 | 0.768 | 0.882 | 0.931 | 0.947 |
| 2002-10-14 | 1.063 | 0.85 | 0.766 | 0.879 | 0.928 | 0.947 |
| 2002-10-21 | 1.061 | 0.851 | 0.767 | 0.879 | 0.928 | 0.947 |
| 2002-10-28 | 1.06 | 0.847 | 0.764 | 0.877 | 0.925 | 0.947 |
| 2002-11-04 | 1.051 | 0.836 | 0.754 | 0.867 | 0.916 | 0.947 |
| 2002-11-11 | 1.039 | 0.825 | 0.744 | 0.856 | 0.904 | 0.947 |
| 2002-11-18 | 1.029 | 0.817 | 0.736 | 0.848 | 0.895 | 0.947 |
| 2002-11-25 | 1.027 | 0.821 | 0.74 | 0.849 | 0.897 | 0.947 |
| 2002-12-02 | 1.031 | 0.827 | 0.746 | 0.854 | 0.898 | 0.947 |
| 2002-12-09 | 1.034 | 0.83 | 0.749 | 0.857 | 0.901 | 0.947 |
| 2002-12-16 | 1.033 | 0.829 | 0.747 | 0.856 | 0.9 | 0.947 |
| 2003-01-06 | 1.061 | 0.856 | 0.772 | 0.88 | 0.927 | 0.947 |
| 2003-01-13 | 1.055 | 0.854 | 0.77 | 0.876 | 0.923 | 0.947 |
| 2003-01-20 | 1.058 | 0.851 | 0.767 | 0.876 | 0.923 | 0.947 |
| 2003-01-27 | 1.062 | 0.854 | 0.77 | 0.879 | 0.926 | 0.947 |
| 2003-02-03 | 1.069 | 0.856 | 0.772 | 0.883 | 0.927 | 0.947 |
| 2003-02-10 | 1.072 | 0.859 | 0.774 | 0.886 | 0.93 | 0.947 |
| 2003-02-17 | 1.086 | 0.877 | 0.791 | 0.901 | 0.946 | 0.947 |
| 2003-02-24 | 1.079 | 0.878 | 0.791 | 0.899 | 0.944 | 0.947 |
| 2003-03-03 | 1.082 | 0.891 | 0.804 | 0.908 | 0.947 | 0.947 |
| 2003-03-10 | 1.081 | 0.899 | 0.811 | 0.912 | 0.952 | 0.947 |
| 2003-03-17 | 1.083 | 0.915 | 0.825 | 0.921 | 0.962 | 0.947 |
| 2003-03-24 | 1.069 | 0.906 | 0.817 | 0.911 | 0.951 | 0.947 |
| 2003-03-31 | 1.053 | 0.885 | 0.798 | 0.893 | 0.932 | 0.947 |
| 2003-04-07 | 1.061 | 0.864 | 0.779 | 0.884 | 0.921 | 0.947 |
| 2003-04-14 | 1.055 | 0.849 | 0.765 | 0.873 | 0.909 | 0.947 |
| 2003-04-28 | 1.044 | 0.842 | 0.759 | 0.865 | 0.901 | 0.947 |
| 2003-05-05 | 1.029 | 0.824 | 0.742 | 0.849 | 0.885 | 0.947 |
| 2003-05-12 | 1.009 | 0.804 | 0.725 | 0.831 | 0.866 | 0.947 |
| 2003-05-19 | 1.008 | 0.799 | 0.721 | 0.828 | 0.863 | 0.947 |
| 2003-05-26 | 1.004 | 0.795 | 0.717 | 0.824 | 0.858 | 0.947 |
| 2003-06-02 | 1.005 | 0.795 | 0.717 | 0.824 | 0.859 | 0.947 |
| 2003-06-09 | 1.011 | 0.799 | 0.721 | 0.829 | 0.864 | 0.947 |
| 2003-06-16 | 1.012 | 0.8 | 0.721 | 0.829 | 0.864 | 0.947 |
| 2003-06-23 | 1.012 | 0.797 | 0.718 | 0.828 | 0.862 | 0.947 |
| 2003-06-30 | 1.012 | 0.796 | 0.718 | 0.828 | 0.862 | 0.947 |
| 2003-07-07 | 1.021 | 0.803 | 0.724 | 0.835 | 0.871 | 0.947 |
| 2003-07-14 | 1.024 | 0.805 | 0.726 | 0.837 | 0.873 | 0.947 |
| 2003-07-21 | 1.026 | 0.807 | 0.728 | 0.839 | 0.876 | 0.947 |
| 2003-07-28 | 1.029 | 0.804 | 0.725 | 0.838 | 0.874 | 0.947 |
| 2003-08-04 | 1.03 | 0.806 | 0.727 | 0.84 | 0.875 | 0.947 |
| 2003-08-18 | 1.04 | 0.816 | 0.736 | 0.849 | 0.884 | 0.947 |
| 2003-08-25 | 1.048 | 0.818 | 0.738 | 0.854 | 0.889 | 0.947 |
| 2003-09-01 | 1.049 | 0.82 | 0.739 | 0.855 | 0.887 | 0.947 |
| 2003-09-08 | 1.042 | 0.81 | 0.73 | 0.847 | 0.878 | 0.947 |
| 2003-09-15 | 1.032 | 0.804 | 0.725 | 0.839 | 0.871 | 0.947 |
| 2003-09-22 | 1.024 | 0.798 | 0.72 | 0.833 | 0.864 | 0.947 |
| 2003-09-29 | 1.02 | 0.795 | 0.717 | 0.83 | 0.861 | 0.947 |
| 2003-10-06 | 1.023 | 0.807 | 0.727 | 0.838 | 0.868 | 0.947 |
| 2003-10-13 | 1.018 | 0.812 | 0.732 | 0.839 | 0.869 | 0.947 |
| 2003-10-20 | 1.027 | 0.827 | 0.745 | 0.85 | 0.881 | 0.947 |
| 2003-10-27 | 1.024 | 0.821 | 0.74 | 0.846 | 0.877 | 0.947 |
| 2003-11-03 | 1.025 | 0.821 | 0.74 | 0.846 | 0.876 | 0.947 |
| 2003-11-10 | 1.023 | 0.822 | 0.741 | 0.846 | 0.876 | 0.947 |
| 2003-11-17 | 1.02 | 0.823 | 0.742 | 0.846 | 0.876 | 0.947 |
| 2003-11-24 | 1.022 | 0.826 | 0.744 | 0.848 | 0.878 | 0.947 |
| 2003-12-01 | 1.017 | 0.82 | 0.739 | 0.843 | 0.87 | 0.947 |
| 2003-12-08 | 1.016 | 0.819 | 0.738 | 0.842 | 0.869 | 0.947 |
| 2003-12-15 | 1.014 | 0.82 | 0.74 | 0.842 | 0.87 | 0.947 |
| 2004-01-05 | 1.013 | 0.82 | 0.74 | 0.837 | 0.868 | 0.947 |
| 2004-01-12 | 1.024 | 0.828 | 0.746 | 0.845 | 0.876 | 0.947 |
| 2004-01-19 | 1.03 | 0.834 | 0.752 | 0.851 | 0.881 | 0.947 |
| 2004-01-26 | 1.035 | 0.837 | 0.755 | 0.855 | 0.886 | 0.947 |
| 2004-02-02 | 1.035 | 0.832 | 0.75 | 0.851 | 0.88 | 0.947 |
| 2004-02-09 | 1.035 | 0.828 | 0.747 | 0.85 | 0.878 | 0.947 |
| 2004-02-16 | 1.038 | 0.827 | 0.746 | 0.85 | 0.879 | 0.947 |
| 2004-02-23 | 1.043 | 0.829 | 0.747 | 0.853 | 0.882 | 0.947 |
| 2004-03-01 | 1.046 | 0.833 | 0.751 | 0.856 | 0.88 | 0.947 |
| 2004-03-08 | 1.06 | 0.847 | 0.764 | 0.87 | 0.894 | 0.947 |
| 2004-03-15 | 1.055 | 0.845 | 0.761 | 0.866 | 0.89 | 0.947 |
| 2004-03-22 | 1.068 | 0.86 | 0.776 | 0.88 | 0.904 | 0.947 |
| 2004-03-29 | 1.071 | 0.862 | 0.777 | 0.882 | 0.907 | 0.947 |
| 2004-04-05 | 1.082 | 0.867 | 0.782 | 0.889 | 0.909 | 0.947 |
| 2004-04-13 | 1.086 | 0.867 | 0.782 | 0.89 | 0.91 | 0.947 |
| 2004-04-19 | 1.086 | 0.87 | 0.784 | 0.892 | 0.912 | 0.947 |
| 2004-04-26 | 1.09 | 0.876 | 0.79 | 0.897 | 0.917 | 0.947 |
| 2004-05-03 | 1.084 | 0.874 | 0.788 | 0.895 | 0.913 | 0.947 |
| 2004-05-10 | 1.098 | 0.88 | 0.794 | 0.903 | 0.921 | 0.947 |
| 2004-05-17 | 1.104 | 0.889 | 0.802 | 0.911 | 0.929 | 0.947 |
| 2004-05-24 | 1.114 | 0.898 | 0.809 | 0.92 | 0.938 | 0.947 |
| 2004-05-31 | 1.116 | 0.898 | 0.809 | 0.92 | 0.938 | 0.947 |
| 2004-06-07 | 1.105 | 0.887 | 0.8 | 0.91 | 0.928 | 0.947 |
| 2004-06-14 | 1.089 | 0.877 | 0.79 | 0.898 | 0.915 | 0.947 |
| 2004-06-21 | 1.083 | 0.872 | 0.787 | 0.894 | 0.911 | 0.947 |
| 2004-06-28 | 1.089 | 0.878 | 0.792 | 0.899 | 0.916 | 0.947 |
| 2004-07-05 | 1.082 | 0.874 | 0.788 | 0.895 | 0.914 | 0.947 |
| 2004-07-12 | 1.1 | 0.889 | 0.801 | 0.909 | 0.929 | 0.947 |
| 2004-07-19 | 1.108 | 0.889 | 0.802 | 0.912 | 0.932 | 0.947 |
| 2004-07-26 | 1.107 | 0.893 | 0.805 | 0.914 | 0.934 | 0.947 |
| 2004-08-02 | 1.11 | 0.902 | 0.813 | 0.92 | 0.939 | 0.947 |
| 2004-08-09 | 1.111 | 0.914 | 0.824 | 0.928 | 0.947 | 0.947 |
| 2004-08-16 | 1.106 | 0.916 | 0.826 | 0.927 | 0.946 | 0.947 |
| 2004-08-23 | 1.108 | 0.923 | 0.832 | 0.932 | 0.951 | 0.947 |
| 2004-08-30 | 1.106 | 0.926 | 0.835 | 0.933 | 0.951 | 0.947 |
| 2004-09-06 | 1.097 | 0.919 | 0.828 | 0.925 | 0.942 | 0.947 |
| 2004-09-13 | 1.092 | 0.917 | 0.827 | 0.923 | 0.94 | 0.947 |
| 2004-09-20 | 1.101 | 0.929 | 0.837 | 0.933 | 0.95 | 0.947 |
| 2004-09-27 | 1.11 | 0.941 | 0.848 | 0.943 | 0.96 | 0.947 |
| 2004-10-04 | 1.11 | 0.947 | 0.854 | 0.946 | 0.96 | 0.947 |
| 2004-10-11 | 1.122 | 0.964 | 0.869 | 0.96 | 0.974 | 0.947 |
| 2004-10-18 | 1.126 | 0.978 | 0.881 | 0.97 | 0.984 | 0.947 |
| 2004-10-25 | 1.122 | 0.982 | 0.885 | 0.971 | 0.985 | 0.947 |
| 2004-11-01 | 1.119 | 0.982 | 0.885 | 0.97 | 0.984 | 0.947 |
| 2004-11-08 | 1.105 | 0.964 | 0.869 | 0.954 | 0.968 | 0.947 |
| 2004-11-15 | 1.099 | 0.954 | 0.86 | 0.946 | 0.96 | 0.947 |
| 2004-11-22 | 1.094 | 0.953 | 0.86 | 0.944 | 0.958 | 0.947 |
| 2004-11-29 | 1.096 | 0.964 | 0.87 | 0.952 | 0.965 | 0.947 |
| 2004-12-06 | 1.085 | 0.96 | 0.866 | 0.945 | 0.955 | 0.947 |
| 2004-12-13 | 1.061 | 0.943 | 0.85 | 0.926 | 0.937 | 0.947 |
| 2004-12-20 | 1.057 | 0.947 | 0.854 | 0.927 | 0.938 | 0.947 |
| 2005-01-03 | 1.041 | 0.935 | 0.843 | 0.913 | 0.928 | 0.947 |
| 2005-01-10 | 1.038 | 0.929 | 0.838 | 0.908 | 0.924 | 0.947 |
| 2005-01-17 | 1.043 | 0.926 | 0.835 | 0.908 | 0.923 | 0.947 |
| 2005-01-24 | 1.046 | 0.928 | 0.836 | 0.91 | 0.926 | 0.947 |
| 2005-01-31 | 1.065 | 0.937 | 0.845 | 0.923 | 0.938 | 0.947 |
| 2005-02-07 | 1.074 | 0.936 | 0.844 | 0.925 | 0.937 | 0.947 |
| 2005-02-14 | 1.071 | 0.932 | 0.841 | 0.922 | 0.934 | 0.947 |
| 2005-02-21 | 1.072 | 0.935 | 0.843 | 0.924 | 0.936 | 0.947 |
| 2005-02-28 | 1.078 | 0.951 | 0.857 | 0.935 | 0.948 | 0.947 |
| 2005-03-07 | 1.087 | 0.968 | 0.873 | 0.948 | 0.955 | 0.947 |
| 2005-03-14 | 1.096 | 0.981 | 0.884 | 0.959 | 0.966 | 0.947 |
| 2005-03-21 | 1.097 | 0.988 | 0.891 | 0.963 | 0.97 | 0.947 |
| 2005-04-04 | 1.124 | 1 | 0.901 | 0.98 | 0.982 | 0.947 |
| 2005-04-11 | 1.151 | 1.021 | 0.921 | 1.002 | 1.004 | 0.947 |
| 2005-04-18 | 1.144 | 1.016 | 0.916 | 0.996 | 0.999 | 0.947 |
| 2005-04-25 | 1.147 | 1.014 | 0.914 | 0.996 | 0.999 | 0.947 |
| 2005-05-02 | 1.15 | 1.012 | 0.913 | 0.996 | 0.997 | 0.947 |
| 2005-05-09 | 1.142 | 1.004 | 0.905 | 0.988 | 0.988 | 0.947 |
| 2005-05-16 | 1.134 | 0.995 | 0.897 | 0.981 | 0.981 | 0.947 |
| 2005-05-23 | 1.126 | 0.989 | 0.891 | 0.974 | 0.974 | 0.947 |
| 2005-05-30 | 1.123 | 0.987 | 0.89 | 0.972 | 0.972 | 0.947 |
| 2005-06-06 | 1.142 | 1.009 | 0.91 | 0.991 | 0.99 | 0.947 |
| 2005-06-13 | 1.157 | 1.029 | 0.928 | 1.009 | 1.008 | 0.947 |
| 2005-06-20 | 1.168 | 1.042 | 0.94 | 1.02 | 1.019 | 0.947 |
| 2005-06-27 | 1.18 | 1.051 | 0.947 | 1.029 | 1.028 | 0.947 |
| 2005-07-04 | 1.186 | 1.056 | 0.952 | 1.034 | 1.035 | 0.947 |
| 2005-07-11 | 1.193 | 1.067 | 0.962 | 1.043 | 1.043 | 0.947 |
| 2005-07-18 | 1.197 | 1.065 | 0.96 | 1.043 | 1.044 | 0.947 |
| 2005-07-25 | 1.199 | 1.06 | 0.955 | 1.041 | 1.041 | 0.947 |
| 2005-08-01 | 1.203 | 1.059 | 0.954 | 1.042 | 1.04 | 0.947 |
| 2005-08-08 | 1.211 | 1.062 | 0.957 | 1.047 | 1.044 | 0.947 |
| 2005-08-22 | 1.237 | 1.089 | 0.981 | 1.071 | 1.069 | 0.947 |
| 2005-08-29 | 1.236 | 1.092 | 0.984 | 1.073 | 1.07 | 0.947 |
| 2005-09-05 | 1.304 | 1.123 | 1.013 | 1.115 | 1.107 | 0.947 |
| 2005-09-12 | 1.3 | 1.117 | 1.007 | 1.111 | 1.103 | 0.947 |
| 2005-09-19 | 1.275 | 1.102 | 0.993 | 1.092 | 1.085 | 0.947 |
| 2005-09-26 | 1.272 | 1.107 | 0.998 | 1.095 | 1.087 | 0.947 |
| 2005-10-03 | 1.285 | 1.122 | 1.012 | 1.108 | 1.097 | 0.947 |
| 2005-10-10 | 1.277 | 1.124 | 1.013 | 1.106 | 1.095 | 0.947 |
| 2005-10-17 | 1.261 | 1.122 | 1.011 | 1.099 | 1.089 | 0.947 |
| 2005-10-24 | 1.243 | 1.116 | 1.006 | 1.089 | 1.079 | 0.947 |
| 2005-11-07 | 1.21 | 1.091 | 0.984 | 1.063 | 1.055 | 0.947 |
| 2005-11-14 | 1.199 | 1.075 | 0.969 | 1.05 | 1.042 | 0.947 |
| 2005-11-21 | 1.174 | 1.056 | 0.952 | 1.03 | 1.022 | 0.947 |
| 2005-11-28 | 1.174 | 1.054 | 0.95 | 1.029 | 1.021 | 0.947 |
| 2005-12-05 | 1.167 | 1.045 | 0.942 | 1.022 | 1.011 | 0.947 |
| 2005-12-12 | 1.172 | 1.052 | 0.949 | 1.027 | 1.016 | 0.947 |
| 2005-12-19 | 1.178 | 1.055 | 0.951 | 1.031 | 1.02 | 0.947 |
| 2006-01-09 | 1.197 | 1.074 | 0.968 | 1.047 | 1.04 | 0.947 |
| 2006-01-16 | 1.202 | 1.07 | 0.965 | 1.046 | 1.04 | 0.947 |
| 2006-01-23 | 1.201 | 1.072 | 0.967 | 1.047 | 1.041 | 0.947 |
| 2006-01-30 | 1.207 | 1.08 | 0.974 | 1.054 | 1.047 | 0.947 |
| 2006-02-06 | 1.21 | 1.085 | 0.978 | 1.058 | 1.048 | 0.947 |
| 2006-02-13 | 1.2 | 1.077 | 0.971 | 1.05 | 1.04 | 0.947 |
| 2006-02-20 | 1.188 | 1.07 | 0.965 | 1.042 | 1.032 | 0.947 |
| 2006-02-27 | 1.189 | 1.073 | 0.968 | 1.044 | 1.034 | 0.947 |
| 2006-03-06 | 1.192 | 1.08 | 0.974 | 1.049 | 1.033 | 0.947 |
| 2006-03-13 | 1.194 | 1.084 | 0.977 | 1.051 | 1.036 | 0.947 |
| 2006-03-20 | 1.208 | 1.09 | 0.982 | 1.06 | 1.045 | 0.947 |
| 2006-03-27 | 1.212 | 1.088 | 0.981 | 1.06 | 1.045 | 0.947 |
| 2006-04-03 | 1.234 | 1.096 | 0.988 | 1.072 | 1.05 | 0.947 |
| 2006-04-10 | 1.241 | 1.098 | 0.99 | 1.077 | 1.054 | 0.947 |
| 2006-04-24 | 1.284 | 1.13 | 1.018 | 1.11 | 1.086 | 0.947 |
| 2006-05-01 | 1.294 | 1.136 | 1.025 | 1.117 | 1.09 | 0.947 |
| 2006-05-08 | 1.297 | 1.136 | 1.024 | 1.118 | 1.091 | 0.947 |
| 2006-05-15 | 1.292 | 1.129 | 1.018 | 1.112 | 1.085 | 0.947 |
| 2006-05-22 | 1.289 | 1.123 | 1.012 | 1.107 | 1.08 | 0.947 |
| 2006-05-29 | 1.276 | 1.112 | 1.003 | 1.097 | 1.07 | 0.947 |
| 2006-06-05 | 1.282 | 1.119 | 1.008 | 1.102 | 1.075 | 0.947 |
| 2006-06-12 | 1.292 | 1.122 | 1.011 | 1.108 | 1.08 | 0.947 |
| 2006-06-19 | 1.283 | 1.115 | 1.005 | 1.101 | 1.073 | 0.947 |
| 2006-06-26 | 1.279 | 1.112 | 1.003 | 1.097 | 1.07 | 0.947 |
| 2006-07-03 | 1.293 | 1.122 | 1.011 | 1.108 | 1.081 | 0.947 |
| 2006-07-10 | 1.303 | 1.125 | 1.014 | 1.113 | 1.087 | 0.947 |
| 2006-07-17 | 1.319 | 1.133 | 1.022 | 1.124 | 1.097 | 0.947 |
| 2006-07-24 | 1.334 | 1.141 | 1.029 | 1.134 | 1.106 | 0.947 |
| 2006-07-31 | 1.331 | 1.136 | 1.025 | 1.13 | 1.103 | 0.947 |
| 2006-08-07 | 1.337 | 1.143 | 1.031 | 1.136 | 1.107 | 0.947 |
| 2006-08-14 | 1.328 | 1.144 | 1.031 | 1.133 | 1.104 | 0.947 |
| 2006-08-21 | 1.297 | 1.133 | 1.022 | 1.116 | 1.088 | 0.947 |
| 2006-08-28 | 1.277 | 1.129 | 1.018 | 1.107 | 1.079 | 0.947 |
| 2006-09-04 | 1.254 | 1.124 | 1.013 | 1.096 | 1.067 | 0.947 |
| 2006-09-11 | 1.224 | 1.105 | 0.996 | 1.075 | 1.046 | 0.947 |
| 2006-09-18 | 1.208 | 1.09 | 0.983 | 1.06 | 1.032 | 0.947 |
| 2006-09-25 | 1.185 | 1.069 | 0.963 | 1.039 | 1.012 | 0.947 |
| 2006-10-02 | 1.174 | 1.06 | 0.956 | 1.031 | 1.002 | 0.947 |
| 2006-10-09 | 1.168 | 1.057 | 0.953 | 1.027 | 0.999 | 0.947 |
| 2006-10-16 | 1.167 | 1.062 | 0.958 | 1.03 | 1.001 | 0.947 |
| 2006-10-23 | 1.162 | 1.06 | 0.956 | 1.027 | 0.998 | 0.947 |
| 2006-10-30 | 1.159 | 1.056 | 0.952 | 1.023 | 0.995 | 0.947 |
| 2006-11-06 | 1.154 | 1.049 | 0.946 | 1.018 | 0.989 | 0.947 |
| 2006-11-13 | 1.158 | 1.05 | 0.947 | 1.019 | 0.991 | 0.947 |
| 2006-11-20 | 1.158 | 1.05 | 0.947 | 1.02 | 0.991 | 0.947 |
| 2006-11-27 | 1.154 | 1.047 | 0.944 | 1.016 | 0.987 | 0.947 |
| 2006-12-04 | 1.162 | 1.053 | 0.949 | 1.022 | 0.99 | 0.947 |
| 2006-12-11 | 1.167 | 1.054 | 0.95 | 1.025 | 0.993 | 0.947 |
| 2006-12-18 | 1.17 | 1.054 | 0.95 | 1.026 | 0.993 | 0.947 |
| 2007-01-08 | 1.175 | 1.048 | 0.944 | 1.021 | 0.993 | 0.947 |
| 2007-01-15 | 1.163 | 1.033 | 0.931 | 1.008 | 0.981 | 0.947 |
| 2007-01-22 | 1.155 | 1.025 | 0.924 | 1 | 0.974 | 0.947 |
| 2007-01-29 | 1.153 | 1.023 | 0.922 | 0.998 | 0.972 | 0.947 |
| 2007-02-05 | 1.16 | 1.029 | 0.928 | 1.005 | 0.974 | 0.947 |
| 2007-02-12 | 1.167 | 1.036 | 0.934 | 1.011 | 0.98 | 0.947 |
| 2007-02-19 | 1.165 | 1.035 | 0.933 | 1.01 | 0.979 | 0.947 |
| 2007-02-26 | 1.177 | 1.04 | 0.937 | 1.016 | 0.986 | 0.947 |
| 2007-03-05 | 1.2 | 1.052 | 0.948 | 1.031 | 0.994 | 0.947 |
| 2007-03-12 | 1.208 | 1.056 | 0.952 | 1.037 | 0.999 | 0.947 |
| 2007-03-19 | 1.208 | 1.052 | 0.948 | 1.034 | 0.996 | 0.947 |
| 2007-03-26 | 1.213 | 1.053 | 0.95 | 1.036 | 0.998 | 0.947 |
| 2007-04-02 | 1.235 | 1.072 | 0.967 | 1.055 | 1.011 | 0.947 |
| 2007-04-16 | 1.251 | 1.08 | 0.974 | 1.065 | 1.02 | 0.947 |
| 2007-04-23 | 1.263 | 1.084 | 0.977 | 1.071 | 1.026 | 0.947 |
| 2007-04-30 | 1.278 | 1.087 | 0.98 | 1.078 | 1.033 | 0.947 |
| 2007-05-07 | 1.287 | 1.086 | 0.979 | 1.081 | 1.033 | 0.947 |
| 2007-05-14 | 1.292 | 1.086 | 0.979 | 1.082 | 1.034 | 0.947 |
| 2007-05-21 | 1.302 | 1.089 | 0.982 | 1.088 | 1.039 | 0.947 |
| 2007-05-28 | 1.313 | 1.093 | 0.986 | 1.094 | 1.045 | 0.947 |
| 2007-06-04 | 1.313 | 1.096 | 0.988 | 1.095 | 1.045 | 0.947 |
| 2007-06-11 | 1.305 | 1.094 | 0.986 | 1.091 | 1.042 | 0.947 |
| 2007-06-18 | 1.31 | 1.105 | 0.996 | 1.1 | 1.049 | 0.947 |
| 2007-06-25 | 1.316 | 1.112 | 1.002 | 1.106 | 1.055 | 0.947 |
| 2007-07-02 | 1.306 | 1.108 | 0.999 | 1.1 | 1.053 | 0.947 |
| 2007-07-09 | 1.307 | 1.107 | 0.998 | 1.1 | 1.053 | 0.947 |
| 2007-07-16 | 1.316 | 1.117 | 1.007 | 1.109 | 1.062 | 0.947 |
| 2007-07-23 | 1.306 | 1.115 | 1.005 | 1.104 | 1.057 | 0.947 |
| 2007-07-30 | 1.292 | 1.112 | 1.003 | 1.098 | 1.051 | 0.947 |
| 2007-08-06 | 1.287 | 1.116 | 1.007 | 1.099 | 1.051 | 0.947 |
| 2007-08-13 | 1.277 | 1.109 | 1 | 1.091 | 1.044 | 0.947 |
| 2007-08-20 | 1.272 | 1.108 | 0.999 | 1.089 | 1.041 | 0.947 |
| 2007-08-27 | 1.267 | 1.104 | 0.996 | 1.085 | 1.038 | 0.947 |
| 2007-09-03 | 1.272 | 1.108 | 0.999 | 1.089 | 1.037 | 0.947 |
| 2007-09-10 | 1.279 | 1.119 | 1.009 | 1.098 | 1.046 | 0.947 |
| 2007-09-17 | 1.275 | 1.129 | 1.018 | 1.103 | 1.051 | 0.947 |
| 2007-09-24 | 1.278 | 1.14 | 1.028 | 1.11 | 1.058 | 0.947 |
| 2007-10-01 | 1.279 | 1.142 | 1.029 | 1.112 | 1.054 | 0.947 |
| 2007-10-08 | 1.276 | 1.136 | 1.024 | 1.107 | 1.049 | 0.947 |
| 2007-10-15 | 1.273 | 1.137 | 1.025 | 1.107 | 1.049 | 0.947 |
| 2007-10-22 | 1.285 | 1.153 | 1.039 | 1.12 | 1.062 | 0.947 |
| 2007-10-29 | 1.291 | 1.163 | 1.048 | 1.128 | 1.069 | 0.947 |
| 2007-11-05 | 1.308 | 1.181 | 1.065 | 1.145 | 1.08 | 0.947 |
| 2007-11-12 | 1.332 | 1.22 | 1.1 | 1.176 | 1.11 | 0.947 |
| 2007-11-19 | 1.326 | 1.223 | 1.102 | 1.176 | 1.109 | 0.947 |
| 2007-11-26 | 1.326 | 1.235 | 1.113 | 1.184 | 1.116 | 0.947 |
| 2007-12-03 | 1.32 | 1.236 | 1.114 | 1.182 | 1.11 | 0.947 |
| 2007-12-10 | 1.305 | 1.219 | 1.099 | 1.167 | 1.096 | 0.947 |
| 2007-12-17 | 1.313 | 1.215 | 1.096 | 1.167 | 1.096 | 0.947 |
| 2008-01-07 | 1.321 | 1.22 | 1.1 | 1.172 | 1.102 | 0.947 |
| 2008-01-14 | 1.31 | 1.206 | 1.087 | 1.16 | 1.09 | 0.947 |
| 2008-01-21 | 1.298 | 1.192 | 1.075 | 1.148 | 1.079 | 0.947 |
| 2008-01-28 | 1.295 | 1.185 | 1.069 | 1.143 | 1.074 | 0.947 |
| 2008-02-04 | 1.299 | 1.191 | 1.073 | 1.148 | 1.074 | 0.947 |
| 2008-02-11 | 1.292 | 1.189 | 1.072 | 1.145 | 1.071 | 0.947 |
| 2008-02-18 | 1.316 | 1.216 | 1.096 | 1.168 | 1.093 | 0.947 |
| 2008-02-25 | 1.328 | 1.236 | 1.114 | 1.184 | 1.108 | 0.947 |
| 2008-03-03 | 1.327 | 1.239 | 1.117 | 1.186 | 1.1 | 0.947 |
| 2008-03-10 | 1.33 | 1.259 | 1.135 | 1.199 | 1.112 | 0.947 |
| 2008-03-17 | 1.326 | 1.273 | 1.147 | 1.206 | 1.119 | 0.947 |
| 2008-03-31 | 1.314 | 1.256 | 1.132 | 1.192 | 1.105 | 0.947 |
| 2008-04-07 | 1.319 | 1.256 | 1.133 | 1.194 | 1.103 | 0.947 |
| 2008-04-14 | 1.327 | 1.279 | 1.153 | 1.21 | 1.118 | 0.947 |
| 2008-04-21 | 1.336 | 1.293 | 1.165 | 1.222 | 1.128 | 0.947 |
| 2008-04-28 | 1.355 | 1.313 | 1.184 | 1.24 | 1.145 | 0.947 |
| 2008-05-05 | 1.365 | 1.327 | 1.196 | 1.251 | 1.149 | 0.947 |
| 2008-05-12 | 1.378 | 1.351 | 1.218 | 1.271 | 1.166 | 0.947 |
| 2008-05-19 | 1.404 | 1.398 | 1.26 | 1.307 | 1.2 | 0.947 |
| 2008-05-26 | 1.418 | 1.424 | 1.283 | 1.328 | 1.219 | 0.947 |
| 2008-06-02 | 1.431 | 1.433 | 1.292 | 1.337 | 1.222 | 0.947 |
| 2008-06-09 | 1.432 | 1.422 | 1.282 | 1.332 | 1.217 | 0.947 |
| 2008-06-16 | 1.449 | 1.439 | 1.297 | 1.347 | 1.231 | 0.947 |
| 2008-06-23 | 1.452 | 1.435 | 1.294 | 1.346 | 1.23 | 0.947 |
| 2008-06-30 | 1.462 | 1.444 | 1.302 | 1.355 | 1.238 | 0.947 |
| 2008-07-07 | 1.474 | 1.454 | 1.311 | 1.365 | 1.249 | 0.947 |
| 2008-07-14 | 1.467 | 1.456 | 1.313 | 1.363 | 1.247 | 0.947 |
| 2008-07-21 | 1.451 | 1.448 | 1.305 | 1.353 | 1.238 | 0.947 |
| 2008-07-28 | 1.423 | 1.415 | 1.276 | 1.324 | 1.211 | 0.947 |
| 2008-08-04 | 1.407 | 1.393 | 1.256 | 1.306 | 1.195 | 0.947 |
| 2008-08-11 | 1.404 | 1.368 | 1.234 | 1.289 | 1.18 | 0.947 |
| 2008-08-18 | 1.387 | 1.342 | 1.21 | 1.268 | 1.16 | 0.947 |
| 2008-08-25 | 1.395 | 1.343 | 1.21 | 1.271 | 1.163 | 0.947 |
| 2008-09-01 | 1.389 | 1.338 | 1.206 | 1.266 | 1.156 | 0.947 |
| 2008-09-08 | 1.381 | 1.325 | 1.194 | 1.256 | 1.146 | 0.947 |
| 2008-09-15 | 1.385 | 1.319 | 1.189 | 1.253 | 1.144 | 0.947 |
| 2008-09-22 | 1.362 | 1.3 | 1.172 | 1.234 | 1.126 | 0.947 |
| 2008-09-29 | 1.351 | 1.297 | 1.17 | 1.229 | 1.122 | 0.947 |
| 2008-10-06 | 1.345 | 1.296 | 1.168 | 1.226 | 1.119 | 0.947 |
| 2008-10-13 | 1.3 | 1.254 | 1.131 | 1.186 | 1.082 | 0.947 |
| 2008-10-20 | 1.242 | 1.207 | 1.088 | 1.139 | 1.039 | 0.947 |
| 2008-10-27 | 1.206 | 1.179 | 1.063 | 1.11 | 1.013 | 0.947 |
| 2008-11-03 | 1.193 | 1.166 | 1.051 | 1.097 | 1.006 | 0.947 |
| 2008-11-10 | 1.158 | 1.153 | 1.039 | 1.078 | 0.988 | 0.947 |
| 2008-11-17 | 1.125 | 1.124 | 1.014 | 1.05 | 0.962 | 0.947 |
| 2008-11-24 | 1.087 | 1.092 | 0.984 | 1.018 | 0.933 | 0.947 |
| 2008-12-01 | 1.076 | 1.073 | 0.968 | 1.003 | 0.921 | 0.947 |
| 2008-12-08 | 1.056 | 1.043 | 0.941 | 0.979 | 0.898 | 0.947 |
| 2008-12-15 | 1.021 | 0.998 | 0.899 | 0.939 | 0.862 | 0.947 |
| 2009-01-05 | 0.984 | 0.949 | 0.856 | 0.897 | 0.83 | 0.947 |
| 2009-01-12 | 1.025 | 0.988 | 0.89 | 0.934 | 0.864 | 0.947 |
| 2009-01-19 | 1.034 | 0.983 | 0.887 | 0.935 | 0.865 | 0.947 |
| 2009-01-26 | 1.032 | 0.972 | 0.876 | 0.927 | 0.858 | 0.947 |
| 2009-02-02 | 1.046 | 0.977 | 0.881 | 0.935 | 0.86 | 0.947 |
| 2009-02-09 | 1.065 | 0.984 | 0.887 | 0.946 | 0.87 | 0.947 |
| 2009-02-16 | 1.061 | 0.972 | 0.876 | 0.937 | 0.862 | 0.947 |
| 2009-02-23 | 1.055 | 0.956 | 0.861 | 0.925 | 0.851 | 0.947 |
| 2009-03-02 | 1.051 | 0.946 | 0.853 | 0.918 | 0.841 | 0.947 |
| 2009-03-09 | 1.054 | 0.939 | 0.846 | 0.914 | 0.838 | 0.947 |
| 2009-03-16 | 1.056 | 0.937 | 0.844 | 0.913 | 0.837 | 0.947 |
| 2009-03-23 | 1.056 | 0.939 | 0.847 | 0.915 | 0.839 | 0.947 |
| 2009-03-30 | 1.077 | 0.959 | 0.864 | 0.934 | 0.856 | 0.947 |
| 2009-04-06 | 1.098 | 0.973 | 0.877 | 0.949 | 0.867 | 0.947 |
| 2009-04-20 | 1.107 | 0.974 | 0.878 | 0.953 | 0.87 | 0.947 |
| 2009-04-27 | 1.109 | 0.972 | 0.876 | 0.952 | 0.87 | 0.947 |
| 2009-05-04 | 1.108 | 0.976 | 0.88 | 0.954 | 0.87 | 0.947 |
| 2009-05-11 | 1.137 | 0.981 | 0.885 | 0.967 | 0.882 | 0.947 |
| 2009-05-18 | 1.152 | 0.986 | 0.889 | 0.975 | 0.889 | 0.947 |
| 2009-05-25 | 1.173 | 0.984 | 0.887 | 0.981 | 0.894 | 0.947 |
| 2009-06-01 | 1.184 | 0.99 | 0.892 | 0.987 | 0.899 | 0.947 |
| 2009-06-08 | 1.195 | 1.009 | 0.91 | 1.003 | 0.913 | 0.947 |
| 2009-06-15 | 1.224 | 1.033 | 0.931 | 1.027 | 0.935 | 0.947 |
| 2009-06-22 | 1.235 | 1.046 | 0.943 | 1.039 | 0.945 | 0.947 |
| 2009-06-29 | 1.22 | 1.041 | 0.939 | 1.031 | 0.938 | 0.947 |
| 2009-07-06 | 1.21 | 1.033 | 0.931 | 1.022 | 0.935 | 0.947 |
| 2009-07-13 | 1.187 | 1.009 | 0.91 | 1.001 | 0.915 | 0.947 |
| 2009-07-20 | 1.185 | 1.002 | 0.903 | 0.995 | 0.91 | 0.947 |
| 2009-07-27 | 1.203 | 1.024 | 0.923 | 1.015 | 0.928 | 0.947 |
| 2009-08-03 | 1.225 | 1.039 | 0.937 | 1.031 | 0.94 | 0.947 |
| 2009-08-10 | 1.235 | 1.05 | 0.947 | 1.041 | 0.949 | 0.947 |
| 2009-08-17 | 1.24 | 1.056 | 0.952 | 1.046 | 0.954 | 0.947 |
| 2009-08-24 | 1.234 | 1.054 | 0.95 | 1.043 | 0.951 | 0.947 |
| 2009-08-31 | 1.221 | 1.048 | 0.945 | 1.035 | 0.944 | 0.947 |
| 2009-09-07 | 1.223 | 1.043 | 0.94 | 1.033 | 0.941 | 0.947 |
| 2009-09-14 | 1.21 | 1.028 | 0.927 | 1.019 | 0.929 | 0.947 |
| 2009-09-21 | 1.198 | 1.025 | 0.924 | 1.013 | 0.924 | 0.947 |
| 2009-09-28 | 1.176 | 1.012 | 0.912 | 0.999 | 0.91 | 0.947 |
| 2009-10-05 | 1.183 | 1.019 | 0.919 | 1.005 | 0.914 | 0.947 |
| 2009-10-12 | 1.171 | 1.014 | 0.914 | 0.998 | 0.908 | 0.947 |
| 2009-10-19 | 1.192 | 1.036 | 0.934 | 1.019 | 0.927 | 0.947 |
| 2009-10-26 | 1.206 | 1.049 | 0.946 | 1.031 | 0.938 | 0.947 |
| 2009-11-02 | 1.222 | 1.059 | 0.954 | 1.042 | 0.946 | 0.947 |
| 2009-11-09 | 1.224 | 1.061 | 0.956 | 1.044 | 0.948 | 0.947 |
| 2009-11-16 | 1.22 | 1.055 | 0.951 | 1.039 | 0.944 | 0.947 |
| 2009-11-23 | 1.221 | 1.054 | 0.951 | 1.039 | 0.944 | 0.947 |
| 2009-11-30 | 1.211 | 1.046 | 0.943 | 1.031 | 0.936 | 0.947 |
| 2009-12-07 | 1.218 | 1.052 | 0.948 | 1.036 | 0.938 | 0.947 |
| 2009-12-14 | 1.205 | 1.044 | 0.941 | 1.027 | 0.93 | 0.947 |
| 2009-12-21 | 1.203 | 1.046 | 0.943 | 1.028 | 0.93 | 0.947 |
| 2010-01-04 | 1.232 | 1.072 | 0.967 | 1.053 | 0.959 | 0.947 |
| 2010-01-11 | 1.264 | 1.098 | 0.99 | 1.079 | 0.983 | 0.947 |
| 2010-01-18 | 1.263 | 1.1 | 0.992 | 1.08 | 0.983 | 0.947 |
| 2010-01-25 | 1.258 | 1.09 | 0.983 | 1.073 | 0.976 | 0.947 |
| 2010-02-01 | 1.256 | 1.084 | 0.977 | 1.068 | 0.969 | 0.947 |
| 2010-02-08 | 1.257 | 1.085 | 0.978 | 1.069 | 0.969 | 0.947 |
| 2010-02-15 | 1.257 | 1.081 | 0.974 | 1.067 | 0.967 | 0.947 |
| 2010-02-22 | 1.264 | 1.093 | 0.985 | 1.076 | 0.976 | 0.947 |
| 2010-03-01 | 1.275 | 1.108 | 0.999 | 1.089 | 0.979 | 0.947 |
| 2010-03-08 | 1.296 | 1.118 | 1.008 | 1.102 | 0.99 | 0.947 |
| 2010-03-15 | 1.321 | 1.137 | 1.025 | 1.122 | 1.008 | 0.947 |
| 2010-03-22 | 1.323 | 1.14 | 1.028 | 1.124 | 1.01 | 0.947 |
| 2010-03-29 | 1.341 | 1.153 | 1.039 | 1.138 | 1.022 | 0.947 |
| 2010-04-12 | 1.354 | 1.178 | 1.062 | 1.157 | 1.035 | 0.947 |
| 2010-04-19 | 1.357 | 1.181 | 1.065 | 1.16 | 1.038 | 0.947 |
| 2010-04-26 | 1.369 | 1.189 | 1.072 | 1.169 | 1.046 | 0.947 |
| 2010-05-03 | 1.374 | 1.202 | 1.084 | 1.179 | 1.053 | 0.947 |
| 2010-05-10 | 1.368 | 1.199 | 1.081 | 1.175 | 1.049 | 0.947 |
| 2010-05-17 | 1.368 | 1.199 | 1.081 | 1.175 | 1.049 | 0.947 |
| 2010-05-24 | 1.342 | 1.176 | 1.06 | 1.152 | 1.029 | 0.947 |
| 2010-05-31 | 1.348 | 1.178 | 1.062 | 1.156 | 1.032 | 0.947 |
| 2010-06-07 | 1.357 | 1.188 | 1.071 | 1.164 | 1.04 | 0.947 |
| 2010-06-14 | 1.361 | 1.195 | 1.077 | 1.17 | 1.045 | 0.947 |
| 2010-06-21 | 1.365 | 1.203 | 1.084 | 1.176 | 1.05 | 0.947 |
| 2010-06-28 | 1.368 | 1.206 | 1.087 | 1.179 | 1.053 | 0.947 |
| 2010-07-05 | 1.352 | 1.188 | 1.071 | 1.163 | 1.041 | 0.947 |
| 2010-07-12 | 1.347 | 1.179 | 1.063 | 1.156 | 1.035 | 0.947 |
| 2010-07-19 | 1.336 | 1.172 | 1.057 | 1.148 | 1.028 | 0.947 |
| 2010-07-26 | 1.343 | 1.172 | 1.057 | 1.15 | 1.03 | 0.947 |
| 2010-08-02 | 1.344 | 1.174 | 1.058 | 1.152 | 1.029 | 0.947 |
| 2010-08-09 | 1.348 | 1.186 | 1.069 | 1.161 | 1.037 | 0.947 |
| 2010-08-16 | 1.34 | 1.179 | 1.063 | 1.154 | 1.031 | 0.947 |
| 2010-08-23 | 1.342 | 1.179 | 1.063 | 1.154 | 1.031 | 0.947 |
| 2010-08-30 | 1.332 | 1.175 | 1.059 | 1.148 | 1.026 | 0.947 |
| 2010-09-06 | 1.328 | 1.174 | 1.059 | 1.147 | 1.022 | 0.947 |
| 2010-09-13 | 1.34 | 1.182 | 1.066 | 1.155 | 1.03 | 0.947 |
| 2010-09-20 | 1.337 | 1.186 | 1.069 | 1.157 | 1.031 | 0.947 |
| 2010-09-27 | 1.318 | 1.176 | 1.06 | 1.145 | 1.02 | 0.947 |
| 2010-10-04 | 1.318 | 1.178 | 1.062 | 1.146 | 1.018 | 0.947 |
| 2010-10-11 | 1.328 | 1.187 | 1.07 | 1.154 | 1.026 | 0.947 |
| 2010-10-18 | 1.333 | 1.188 | 1.071 | 1.157 | 1.028 | 0.947 |
| 2010-10-25 | 1.336 | 1.192 | 1.074 | 1.16 | 1.031 | 0.947 |
| 2010-11-08 | 1.344 | 1.2 | 1.082 | 1.168 | 1.036 | 0.947 |
| 2010-11-15 | 1.354 | 1.212 | 1.093 | 1.178 | 1.045 | 0.947 |
| 2010-11-22 | 1.35 | 1.209 | 1.09 | 1.175 | 1.043 | 0.947 |
| 2010-11-29 | 1.365 | 1.218 | 1.098 | 1.185 | 1.052 | 0.947 |
| 2010-12-06 | 1.39 | 1.239 | 1.117 | 1.206 | 1.063 | 0.947 |
| 2010-12-13 | 1.404 | 1.256 | 1.133 | 1.221 | 1.077 | 0.947 |
| 2010-12-20 | 1.408 | 1.263 | 1.139 | 1.227 | 1.082 | 0.947 |
| 2011-01-03 | 1.421 | 1.28 | 1.154 | 1.241 | 1.099 | 0.947 |
| 2011-01-10 | 1.443 | 1.296 | 1.169 | 1.258 | 1.114 | 0.947 |
| 2011-01-17 | 1.456 | 1.317 | 1.187 | 1.275 | 1.129 | 0.947 |
| 2011-01-24 | 1.445 | 1.311 | 1.182 | 1.268 | 1.123 | 0.947 |
| 2011-01-31 | 1.432 | 1.304 | 1.175 | 1.259 | 1.115 | 0.947 |
| 2011-02-07 | 1.442 | 1.325 | 1.194 | 1.275 | 1.124 | 0.947 |
| 2011-02-14 | 1.447 | 1.334 | 1.202 | 1.282 | 1.13 | 0.947 |
| 2011-02-21 | 1.449 | 1.337 | 1.205 | 1.285 | 1.132 | 0.947 |
| 2011-02-28 | 1.472 | 1.358 | 1.224 | 1.305 | 1.151 | 0.947 |
| 2011-03-07 | 1.486 | 1.378 | 1.242 | 1.322 | 1.152 | 0.947 |
| 2011-03-14 | 1.516 | 1.389 | 1.252 | 1.338 | 1.167 | 0.947 |
| 2011-03-21 | 1.5 | 1.387 | 1.251 | 1.332 | 1.161 | 0.947 |
| 2011-03-28 | 1.506 | 1.385 | 1.249 | 1.333 | 1.162 | 0.947 |
| 2011-04-04 | 1.521 | 1.388 | 1.251 | 1.339 | 1.161 | 0.947 |
| 2011-04-11 | 1.537 | 1.402 | 1.264 | 1.353 | 1.172 | 0.947 |
| 2011-04-18 | 1.548 | 1.406 | 1.267 | 1.359 | 1.178 | 0.947 |
| 2011-05-02 | 1.544 | 1.404 | 1.266 | 1.357 | 1.175 | 0.947 |
| 2011-05-09 | 1.527 | 1.374 | 1.239 | 1.333 | 1.154 | 0.947 |
| 2011-05-16 | 1.524 | 1.361 | 1.227 | 1.324 | 1.146 | 0.947 |
| 2011-05-23 | 1.518 | 1.364 | 1.23 | 1.324 | 1.146 | 0.947 |
| 2011-05-30 | 1.508 | 1.356 | 1.223 | 1.316 | 1.139 | 0.947 |
| 2011-06-06 | 1.505 | 1.358 | 1.224 | 1.316 | 1.139 | 0.947 |
| 2011-06-13 | 1.5 | 1.367 | 1.232 | 1.32 | 1.143 | 0.947 |